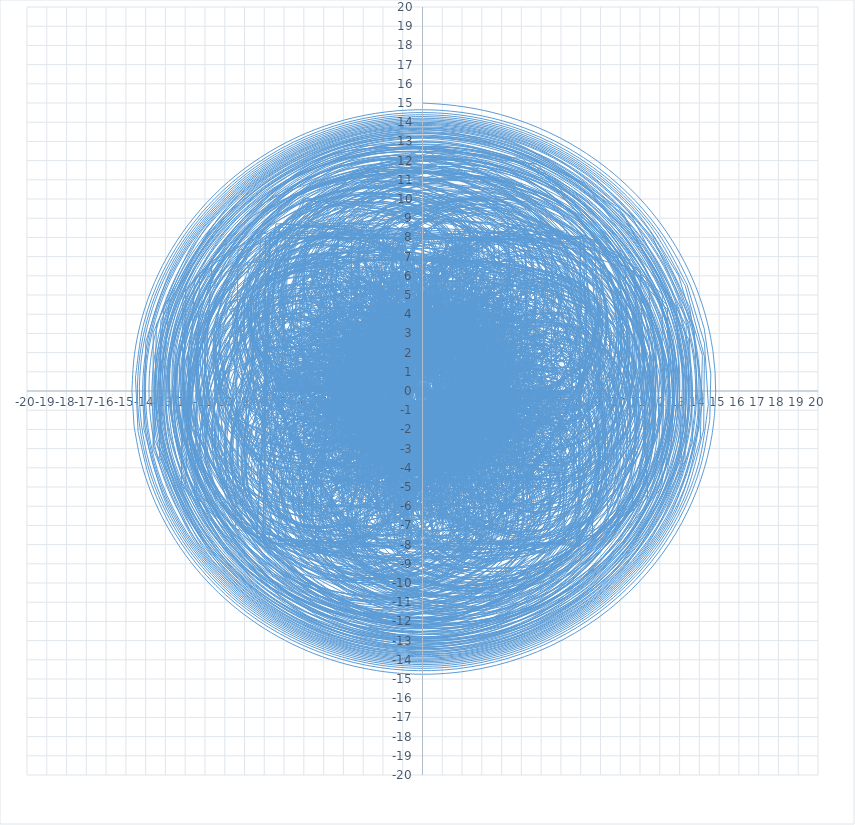
| Category | Series 0 |
|---|---|
| -5.104785228785916e-19 | -0.004 |
| -1.454440304915473e-05 | -0.008 |
| -6.544954789272613e-05 | -0.012 |
| -0.00017452973527082584 | -0.017 |
| -0.0003635918007768142 | -0.021 |
| -0.0006544237076970437 | -0.025 |
| -0.0010687748372749004 | -0.029 |
| -0.0016283256598540903 | -0.033 |
| -0.0023546444823498484 | -0.037 |
| -0.003269128988660912 | -0.042 |
| -0.004392930323844822 | -0.046 |
| -0.00574685752464488 | -0.05 |
| -0.007351260173526437 | -0.054 |
| -0.009225887256514537 | -0.058 |
| -0.011389720343262553 | -0.061 |
| -0.013860779387853956 | -0.065 |
| -0.016655899678104033 | -0.069 |
| -0.01979047874740811 | -0.072 |
| -0.02327819241423012 | -0.076 |
| -0.027130679538102973 | -0.079 |
| -0.0313571955852216 | -0.082 |
| -0.03596423568866606 | -0.084 |
| -0.04095512857461372 | -0.087 |
| -0.04632960351199377 | -0.089 |
| -0.052083333333344056 | -0.09 |
| -0.05820745757091802 | -0.091 |
| -0.06468809085488048 | -0.092 |
| -0.0715058229261951 | -0.092 |
| -0.07863521791963915 | -0.092 |
| -0.08604432196173382 | -0.091 |
| -0.0936941895891015 | -0.089 |
| -0.10153844100491545 | -0.086 |
| -0.10952286372834506 | -0.083 |
| -0.11758507372186076 | -0.079 |
| -0.1256542525644078 | -0.074 |
| -0.1336509786282715 | -0.068 |
| -0.14148717145962994 | -0.061 |
| -0.14906616959525373 | -0.053 |
| -0.15628296280176077 | -0.045 |
| -0.1630246001223116 | -0.035 |
| -0.169170795076693 | -0.024 |
| -0.17459474879623552 | -0.012 |
| -0.1791642106943304 | 0.001 |
| -0.18274279438364 | 0.015 |
| -0.1851915638615773 | 0.029 |
| -0.186370901409537 | 0.045 |
| -0.18614266411041525 | 0.061 |
| -0.18437263031766452 | 0.078 |
| -0.18093323075965861 | 0.095 |
| -0.1757065512109617 | 0.112 |
| -0.16858758481182182 | 0.129 |
| -0.15948770220919925 | 0.147 |
| -0.14833829680873786 | 0.164 |
| -0.13509455069822013 | 0.18 |
| -0.11973925441396206 | 0.195 |
| -0.10228660091732344 | 0.21 |
| -0.08278586123878236 | 0.223 |
| -0.06132483660784943 | 0.234 |
| -0.0380329699651304 | 0.243 |
| -0.013083989060555029 | 0.25 |
| 0.013302055545260299 | 0.254 |
| 0.04085750070759938 | 0.255 |
| 0.06926667561609934 | 0.253 |
| 0.09816654738278136 | 0.248 |
| 0.127148548254709 | 0.239 |
| 0.15576171515452092 | 0.227 |
| 0.18351725611770328 | 0.21 |
| 0.2098946356147542 | 0.19 |
| 0.23434924127211124 | 0.167 |
| 0.256321657859867 | 0.139 |
| 0.27524853052812187 | 0.108 |
| 0.2905749483386639 | 0.075 |
| 0.3017682216498594 | 0.038 |
| 0.3083328637149296 | -0.001 |
| 0.30982651917927023 | -0.041 |
| 0.30587651165811386 | -0.082 |
| 0.29619661132361036 | -0.123 |
| 0.280603553947006 | -0.164 |
| 0.25903277806202746 | -0.203 |
| 0.23155279015270086 | -0.24 |
| 0.1983775226483588 | -0.273 |
| 0.1598760198719595 | -0.302 |
| 0.11657877687089918 | -0.326 |
| 0.0691800691322319 | -0.343 |
| 0.01853565116887246 | -0.354 |
| -0.03434472798691112 | -0.357 |
| -0.08831044177295654 | -0.352 |
| -0.14208904836630892 | -0.338 |
| -0.19431144013107282 | -0.316 |
| -0.24354301812427367 | -0.285 |
| -0.28832059529040815 | -0.246 |
| -0.32719447228920173 | -0.2 |
| -0.35877485161411676 | -0.146 |
| -0.38178146772504423 | -0.087 |
| -0.39509502437536437 | -0.024 |
| -0.3978087581472327 | 0.042 |
| -0.38927820408051445 | 0.109 |
| -0.36916704111116105 | 0.175 |
| -0.33748675843736253 | 0.237 |
| -0.29462782549382976 | 0.295 |
| -0.2413800836303687 | 0.345 |
| -0.17894022068036178 | 0.385 |
| -0.10890445121675787 | 0.415 |
| -0.03324491218735728 | 0.432 |
| 0.04573120268054635 | 0.435 |
| 0.1254401105785025 | 0.423 |
| 0.20309710447583681 | 0.397 |
| 0.2758081741446588 | 0.356 |
| 0.34067544412454365 | 0.3 |
| 0.39491336520293174 | 0.233 |
| 0.4359716896305023 | 0.154 |
| 0.4616604220495559 | 0.068 |
| 0.4702712229981992 | -0.023 |
| 0.46068920725995766 | -0.116 |
| 0.43248878208377906 | -0.206 |
| 0.38600716318874356 | -0.291 |
| 0.32238953434429224 | -0.366 |
| 0.24360051197810248 | -0.427 |
| 0.15239765632443522 | -0.472 |
| 0.05226423163237646 | -0.497 |
| -0.05269976689887299 | -0.501 |
| -0.15792718506369668 | -0.483 |
| -0.2585704072065173 | -0.442 |
| -0.349719251003872 | -0.38 |
| -0.4266416897347561 | -0.299 |
| -0.48503675456905415 | -0.201 |
| -0.5212870184238623 | -0.091 |
| -0.5326966065820143 | 0.026 |
| -0.5176998796532736 | 0.145 |
| -0.47602593602436105 | 0.258 |
| -0.40880499759610334 | 0.362 |
| -0.31860464478693706 | 0.448 |
| -0.20938676936012024 | 0.513 |
| -0.0863799656819272 | 0.552 |
| 0.04413324134892146 | 0.561 |
| 0.17510963014777134 | 0.539 |
| 0.29910862132640015 | 0.486 |
| 0.40870969747851427 | 0.404 |
| 0.4969625912327408 | 0.297 |
| 0.557844440979084 | 0.171 |
| 0.5866948516684363 | 0.031 |
| 0.5805981595282876 | -0.114 |
| 0.5386825191718526 | -0.255 |
| 0.4623079456638762 | -0.382 |
| 0.3551202565913106 | -0.489 |
| 0.2229549129216034 | -0.566 |
| 0.07358381378367124 | -0.608 |
| -0.08369126967049006 | -0.611 |
| -0.23858334615383878 | -0.573 |
| -0.38047589313263386 | -0.496 |
| -0.499151476601666 | -0.383 |
| -0.5855458212889059 | -0.241 |
| -0.6324731220883463 | -0.08 |
| -0.6352651803677118 | 0.09 |
| -0.5922679647058213 | 0.258 |
| -0.5051448749450569 | 0.409 |
| -0.3789464335715813 | 0.533 |
| -0.22192104512542876 | 0.62 |
| -0.04506013006239162 | 0.661 |
| 0.13860779388175706 | 0.652 |
| 0.3149371733718577 | 0.592 |
| 0.469741137702348 | 0.485 |
| 0.5899455702243922 | 0.336 |
| 0.6647301834439254 | 0.158 |
| 0.6865578051435735 | -0.036 |
| 0.6519936980041591 | -0.231 |
| 0.562226294210133 | -0.41 |
| 0.4232193804005382 | -0.558 |
| 0.2454528166519929 | -0.66 |
| 0.04324271549978293 | -0.707 |
| -0.16632982175142835 | -0.693 |
| -0.3648130146247738 | -0.617 |
| -0.5339966464929975 | -0.484 |
| -0.657606910363201 | -0.305 |
| -0.7229285447523228 | -0.095 |
| -0.7221923522081626 | 0.127 |
| -0.653575139680829 | 0.342 |
| -0.5216844045811431 | 0.527 |
| -0.3374408873575283 | 0.665 |
| -0.11732584877526837 | 0.741 |
| 0.11797765905611353 | 0.745 |
| 0.3454548879898285 | 0.675 |
| 0.5419845988317993 | 0.536 |
| 0.6867123495191727 | 0.341 |
| 0.7633316363223538 | 0.107 |
| 0.7620225533610893 | -0.141 |
| 0.6808141904458223 | -0.379 |
| 0.5261811282988511 | -0.58 |
| 0.3127539638698174 | -0.723 |
| 0.062113450778844885 | -0.789 |
| -0.19926075323229867 | -0.77 |
| -0.44271323939954743 | -0.666 |
| -0.6405428090814026 | -0.486 |
| -0.7692054764711179 | -0.248 |
| -0.8122215765424814 | 0.021 |
| -0.7624240149704944 | 0.293 |
| -0.6232351980999136 | 0.534 |
| -0.40875340145115685 | 0.717 |
| -0.14255787897518044 | 0.817 |
| 0.1447068147290208 | 0.821 |
| 0.41875000000594875 | 0.725 |
| 0.6456973361156821 | 0.54 |
| 0.7963271691558705 | 0.285 |
| 0.8499533939606124 | -0.009 |
| 0.7974332809638068 | -0.306 |
| 0.6428536603390833 | -0.569 |
| 0.4035894647932895 | -0.762 |
| 0.10862213574813917 | -0.86 |
| -0.20476959016766846 | -0.846 |
| -0.49560545731555977 | -0.721 |
| -0.7245442741680301 | -0.498 |
| -0.8592853590868085 | -0.205 |
| -0.8792887084173167 | 0.12 |
| -0.7791135655360496 | 0.434 |
| -0.5698200723257227 | 0.691 |
| -0.27811529492949805 | 0.856 |
| 0.05677309474956199 | 0.902 |
| 0.38818339258459283 | 0.821 |
| 0.6684453951495252 | 0.621 |
| 0.855782057625634 | 0.329 |
| 0.9206930859563558 | -0.016 |
| 0.8508348850190159 | -0.363 |
| 0.6535709113547911 | -0.66 |
| 0.3556656845850766 | -0.863 |
| -9.618975334670968e-12 | -0.938 |
| -0.36036023215277385 | -0.87 |
| -0.6699714298546475 | -0.668 |
| -0.8795770555732143 | -0.359 |
| -0.9541143491028204 | 0.01 |
| -0.8788492379483361 | 0.382 |
| -0.662541279097799 | 0.698 |
| -0.336952979067996 | 0.906 |
| 0.047424984853695534 | 0.97 |
| 0.4289406906190735 | 0.876 |
| 0.7445641746569885 | 0.636 |
| 0.9403663433668403 | 0.287 |
| 0.9809556060291267 | -0.114 |
| 0.8562005876793911 | -0.5 |
| 0.5839291385733678 | -0.807 |
| 0.20791169080645602 | -0.978 |
| -0.20877798954092944 | -0.982 |
| -0.5941063270074136 | -0.815 |
| -0.8794894083746565 | -0.502 |
| -1.012154664014272 | -0.096 |
| -0.9652168792537067 | 0.332 |
| -0.7435087302789259 | 0.706 |
| -0.38386659288929464 | 0.955 |
| 0.05047809546807925 | 1.032 |
| 0.48066963644823024 | 0.919 |
| 0.8264097294780538 | 0.634 |
| 1.0210429074491112 | 0.226 |
| 1.0247126000327862 | -0.229 |
| 0.8329550755377463 | -0.646 |
| 0.4788267340094455 | -0.944 |
| 0.027813007563421692 | -1.062 |
| -0.4338524192935121 | -0.974 |
| -0.8154806043297573 | -0.694 |
| -1.0398128342377018 | -0.273 |
| -1.0589783332221911 | 0.208 |
| -0.8651884692089665 | 0.652 |
| -0.49371466845345263 | 0.969 |
| -0.017147154717167497 | 1.092 |
| 0.46831299197537035 | 0.991 |
| 0.8620628030678982 | 0.683 |
| 1.0800379758134402 | 0.23 |
| 1.0730303014151492 | -0.278 |
| 0.8383392739250188 | -0.731 |
| 0.42192221193239454 | -1.034 |
| -0.08988962770146636 | -1.117 |
| -0.5878108853193478 | -0.959 |
| -0.9627728522585834 | -0.59 |
| -1.1299931191917987 | -0.087 |
| -1.0486193349254107 | 0.441 |
| -0.7323216626949678 | 0.876 |
| -0.24800372428710715 | 1.119 |
| 0.2976419018847994 | 1.111 |
| 0.7812276816882795 | 0.85 |
| 1.0905367144133067 | 0.39 |
| 1.1509025020929342 | -0.164 |
| 0.9438531600934806 | -0.686 |
| 0.5132595510154553 | -1.052 |
| -0.04305635774874858 | -1.174 |
| -0.5949221564315137 | -1.018 |
| -1.0100351101189406 | -0.617 |
| -1.1858725725220707 | -0.062 |
| -1.0755807971752294 | 0.513 |
| -0.7012036099140817 | 0.969 |
| -0.15039988025729706 | 1.191 |
| 0.4432833155432017 | 1.12 |
| 0.9323797049396436 | 0.769 |
| 1.1921965754249906 | 0.221 |
| 1.153118232171668 | -0.388 |
| 0.8200588861162241 | -0.904 |
| 0.27348139209285727 | -1.194 |
| -0.3491021945523112 | -1.179 |
| -0.8871857537660258 | -0.857 |
| -1.1986216619021106 | -0.308 |
| -1.1976587945793067 | 0.328 |
| -0.8793983317881435 | 0.882 |
| -0.32352380635634437 | 1.207 |
| 0.32460221908786446 | 1.211 |
| 0.8913276291527126 | 0.888 |
| 1.2211755378854445 | 0.32 |
| 1.220005917937396 | -0.341 |
| 0.8827950124414352 | -0.914 |
| 0.29764283889301435 | -1.24 |
| -0.37612658271590227 | -1.223 |
| -0.9506992319175689 | -0.862 |
| -1.262099137330256 | -0.254 |
| -1.217578592652455 | 0.431 |
| -0.8242513604240725 | 1 |
| -0.18990793710627402 | 1.286 |
| 0.5053849106881662 | 1.202 |
| 1.0598044795983905 | 0.767 |
| 1.3084540005267633 | 0.103 |
| 1.1731585901695516 | -0.598 |
| 0.6881668887001827 | -1.127 |
| -0.006937652103412242 | -1.325 |
| -0.7063172786320451 | -1.126 |
| -1.1983920617442003 | -0.584 |
| -1.3301730350521799 | 0.14 |
| -1.055804487781072 | 0.828 |
| -0.45367403526814887 | 1.267 |
| 0.29449337591293984 | 1.317 |
| 0.9575404328769747 | 0.958 |
| 1.326135409677447 | 0.294 |
| 1.2795159184689677 | -0.468 |
| 0.8262854569551158 | -1.089 |
| 0.10516900102780252 | -1.367 |
| -0.6560932953830106 | -1.208 |
| -1.2120352678940833 | -0.658 |
| -1.3788774485287139 | 0.111 |
| -1.0963400796525251 | 0.85 |
| -0.4507850736296426 | 1.317 |
| 0.34948875568954096 | 1.351 |
| 1.0404027556894055 | 0.937 |
| 1.3891032342068037 | 0.205 |
| 1.2732495907585009 | -0.602 |
| 0.7253770185044223 | -1.212 |
| -0.07414260470977807 | -1.415 |
| -0.855078845421656 | -1.135 |
| -1.3481716363399823 | -0.462 |
| -1.3785133105371332 | 0.377 |
| -0.9289718581650638 | 1.092 |
| -0.15025966591383885 | 1.43 |
| 0.6879038794041373 | 1.267 |
| 1.289390594902873 | 0.654 |
| 1.4365843686788826 | -0.197 |
| 1.070407847496298 | -0.984 |
| 0.3156411036251879 | -1.424 |
| -0.5596745198666007 | -1.351 |
| -1.2383476240889937 | -0.786 |
| -1.4690773603379355 | 0.072 |
| -1.1607291573705476 | 0.91 |
| -0.42010603067238217 | 1.418 |
| 0.4829260958133139 | 1.403 |
| 1.2125025961680078 | 0.862 |
| 1.4916462192688744 | -0.008 |
| 1.2086182013082551 | -0.881 |
| 0.46352549152578515 | -1.427 |
| -0.4648130624087196 | -1.431 |
| -1.221812807695217 | -0.884 |
| -1.5124792670240208 | 0.008 |
| -1.2176065040163884 | 0.904 |
| -0.4446486342277143 | 1.454 |
| 0.5090554603697169 | 1.438 |
| 1.2692271193143767 | 0.853 |
| 1.531502743921516 | -0.075 |
| 1.1846641107412086 | -0.98 |
| 0.3598949359039483 | -1.499 |
| -0.616399602418759 | -1.418 |
| -1.3503814072571008 | -0.761 |
| -1.5397872687268543 | 0.211 |
| -1.0999831976103829 | 1.104 |
| -0.2039471753007621 | 1.549 |
| 0.7833333333713769 | 1.357 |
| 1.4523077278160663 | 0.599 |
| 1.5191779340593932 | -0.416 |
| 0.9481636057915845 | -1.263 |
| -0.027632976904017757 | -1.583 |
| -0.999046120827162 | -1.234 |
| -1.551494900764616 | -0.355 |
| -1.4427650688138232 | 0.682 |
| -0.7114162866537673 | 1.433 |
| 0.33352500406623026 | 1.569 |
| 1.241029538312055 | 1.023 |
| 1.612301069877421 | 0.025 |
| 1.277417269978045 | -0.991 |
| 0.37562472686677534 | -1.577 |
| -0.6995805323577577 | -1.467 |
| -1.4704618591079983 | -0.701 |
| -1.5875363009332835 | 0.384 |
| -0.990031050547445 | 1.304 |
| 0.06015675517679974 | 1.641 |
| 1.0905621627264805 | 1.233 |
| 1.629685761989935 | 0.258 |
| 1.4238107696425777 | -0.842 |
| 0.5590163035029724 | -1.561 |
| -0.5713342422977348 | -1.561 |
| -1.4433756730002911 | -0.833 |
| -1.6454496206485905 | 0.29 |
| -1.0744281328374172 | 1.285 |
| 0.00879205598690951 | 1.679 |
| 1.0954699324387178 | 1.278 |
| 1.6667240747628402 | 0.264 |
| 1.4423829446701206 | -0.884 |
| 0.5212255976328655 | -1.614 |
| -0.6587764970205111 | -1.567 |
| -1.5264421247662394 | -0.758 |
| -1.6539188856317317 | 0.428 |
| -0.9699706806863168 | 1.411 |
| 0.19730877507027061 | 1.705 |
| 1.2748012428155007 | 1.156 |
| 1.724787191031776 | 0.027 |
| 1.3148686488115104 | -1.123 |
| 0.24123337493908442 | -1.716 |
| -0.961517816859891 | -1.447 |
| -1.6846580027664246 | -0.442 |
| -1.5541631880226603 | 0.795 |
| -0.6271439116473064 | 1.634 |
| 0.6286371115508883 | 1.638 |
| 1.5680773229171092 | 0.796 |
| 1.7000324500154878 | -0.465 |
| 0.946627337743388 | -1.492 |
| -0.3075019813467456 | -1.744 |
| -1.40820217905557 | -1.081 |
| -1.7721230622043167 | 0.158 |
| -1.1979017175782845 | 1.321 |
| 0.018718314172996308 | 1.787 |
| 1.2333019481654293 | 1.3 |
| 1.7924837421699529 | 0.11 |
| 1.3869238369545451 | -1.147 |
| 0.22612204215540993 | -1.79 |
| -1.0654634129346343 | -1.461 |
| -1.7821495199719373 | -0.33 |
| -1.5235848650633281 | 0.989 |
| -0.4219743075451373 | 1.771 |
| 0.9207629135222993 | 1.576 |
| 1.7591851454026954 | 0.501 |
| 1.6187372535418796 | -0.861 |
| 0.5678187270965085 | -1.748 |
| -0.8102213045479602 | -1.654 |
| -1.7377977139898182 | -0.622 |
| -1.6820868017070945 | 0.77 |
| -0.6644739063811003 | 1.731 |
| 0.7410086864861432 | 1.704 |
| 1.7280950229141434 | 0.695 |
| 1.7208112162700213 | -0.723 |
| 0.7129191623536449 | -1.73 |
| -0.7175314357541211 | -1.732 |
| -1.7361236215395877 | -0.719 |
| -1.73871257553347 | 0.724 |
| -0.7131744850496673 | 1.748 |
| 0.7421710456461705 | 1.74 |
| 1.7639166393275851 | 0.695 |
| 1.7357363694894044 | -0.773 |
| 0.6637392733680322 | -1.785 |
| -0.8155412560358355 | -1.725 |
| -1.8093882487834796 | -0.619 |
| -1.7077625046580729 | 0.87 |
| -0.5615973160779434 | 1.837 |
| 0.9361956073862369 | 1.682 |
| 1.8660207064174565 | 0.49 |
| 1.6466720726332382 | -1.013 |
| 0.40282890087793566 | -1.895 |
| -1.099772110097674 | -1.6 |
| -1.9224052388225188 | -0.301 |
| -1.5408022740806115 | 1.195 |
| -0.18390332885901672 | 1.945 |
| 1.2976309278198974 | 1.467 |
| 1.9618275002668029 | 0.051 |
| 1.37600456961458 | -1.405 |
| -0.09627475472588515 | -1.968 |
| -1.515151174891184 | -1.267 |
| -1.9622346214574489 | 0.258 |
| -1.1375932653565821 | 1.625 |
| 0.4335596923625365 | 1.94 |
| 1.7300244329673955 | 0.987 |
| 1.8970709810123132 | -0.62 |
| 0.8134732860682344 | -1.827 |
| -0.8151680222477978 | -1.831 |
| -1.9111187611529543 | -0.617 |
| -1.7375835455492323 | 1.015 |
| -0.39860896967360887 | 1.977 |
| 1.2161678593620773 | 1.614 |
| 2.018757600817045 | 0.159 |
| 1.4571979458118907 | -1.412 |
| -0.0993278653465198 | -2.031 |
| -1.5967754193614292 | -1.266 |
| -2.0074787695920575 | 0.372 |
| -1.0383389008062465 | 1.763 |
| 0.6538665841545267 | 1.943 |
| 1.901892493001225 | 0.776 |
| 1.8323546894459757 | -0.938 |
| 0.48148106285638026 | -2.006 |
| -1.2147561881529068 | -1.672 |
| -2.0647300744110324 | -0.159 |
| -1.459544008259309 | 1.475 |
| 0.18482605900387714 | 2.071 |
| 1.7065667589944482 | 1.195 |
| 2.0163701623516905 | -0.54 |
| 0.8806665761993582 | -1.897 |
| -0.8956708554438156 | -1.895 |
| -2.0340246383962657 | -0.522 |
| -1.7023065922685758 | 1.237 |
| -0.12871067074561088 | 2.104 |
| 1.547496873761366 | 1.438 |
| 2.0970829289832964 | -0.287 |
| 1.1049745941029483 | -1.81 |
| -0.709339575975347 | -2.003 |
| -2.007040841487151 | -0.711 |
| -1.8170174594473483 | 1.118 |
| -0.2678997866326264 | 2.121 |
| 1.4904132394488867 | 1.538 |
| 2.135954342318837 | -0.206 |
| 1.1709739251879567 | -1.803 |
| -0.6870915122211587 | -2.042 |
| -2.032007259257815 | -0.728 |
| -1.8319011549275348 | 1.149 |
| -0.2264783369645877 | 2.155 |
| 1.5615668166496015 | 1.508 |
| 2.1533014555170578 | -0.306 |
| 1.0796870148571769 | -1.893 |
| -0.8390447879168962 | -2.016 |
| -2.1129627450383133 | -0.566 |
| -1.7387660707320276 | 1.334 |
| 0.0038324503246826573 | 2.196 |
| 1.7523658197269543 | 1.33 |
| 2.122970824283734 | -0.593 |
| 0.8093568755692003 | -2.055 |
| -1.1560280745394567 | -1.886 |
| -2.206829021548544 | -0.209 |
| -1.4917794753626155 | 1.645 |
| 0.428361375643575 | 2.183 |
| 2.012013029750977 | 0.96 |
| 1.971916290658544 | -1.048 |
| 0.32686077628240306 | -2.213 |
| -1.5933754873558794 | -1.577 |
| -2.2175668409742904 | 0.355 |
| -1.0214786242987044 | 2.005 |
| 1.0233702516116947 | 2.008 |
| 2.231142696882828 | 0.349 |
| 1.5914305150150503 | -1.608 |
| -0.3780091593531828 | -2.235 |
| -2.0410114801965364 | -0.995 |
| -1.9993089312421608 | 1.086 |
| -0.2738118783770136 | 2.263 |
| 1.6915038282785584 | 1.534 |
| 2.232409592904979 | -0.499 |
| 0.8769828657103276 | -2.117 |
| -1.233550350945712 | -1.936 |
| -2.297982509233202 | -0.096 |
| -1.3930971270510544 | 1.835 |
| 0.7171447585307813 | 2.194 |
| 2.2172706369224917 | 0.657 |
| 1.8003881439523484 | -1.458 |
| -0.18612833702137108 | -2.313 |
| -2.019568271139538 | -1.152 |
| -2.0916558951453466 | 1.025 |
| -0.32473723542961663 | 2.311 |
| 1.7371010296503446 | 1.564 |
| 2.2711169690896145 | -0.57 |
| 0.7907692935791046 | -2.209 |
| -1.4011284562875503 | -1.887 |
| -2.3509403630603187 | 0.123 |
| -1.1969446391862368 | 2.032 |
| 1.0393562889197094 | 2.122 |
| 2.348004793129864 | 0.297 |
| 1.536584265321598 | -1.805 |
| -0.6745364438184037 | -2.277 |
| -2.2811919525840985 | -0.676 |
| -1.809596615714718 | 1.551 |
| 0.3240209293412526 | 2.365 |
| 2.1693469342460725 | 1.007 |
| 2.020625338842734 | -1.287 |
| -1.570031099920608e-10 | -2.4 |
| -2.029905054313018 | -1.288 |
| -2.177332140364981 | 1.029 |
| -0.28983012352996335 | 2.395 |
| 1.878102740289433 | 1.521 |
| 2.2889428850440616 | -0.788 |
| 0.5413815311687026 | -2.364 |
| -1.7266503887308091 | -1.709 |
| -2.3651051013691253 | 0.572 |
| -0.7532289236324029 | 2.318 |
| 1.5857356514658267 | 1.857 |
| 2.4150496023185792 | -0.387 |
| 0.925709927549955 | -2.268 |
| -1.463235214112912 | -1.97 |
| -2.4470156543031933 | 0.236 |
| -1.0601335757367736 | 2.223 |
| 1.3650324882762839 | 2.055 |
| 2.4678834976727613 | -0.121 |
| 1.1581262901418115 | -2.187 |
| -1.2953610251734236 | -2.114 |
| -2.482955109635348 | 0.043 |
| -1.2211230869656438 | 2.167 |
| 1.2571146628246328 | 2.151 |
| 2.495829531962454 | -0.004 |
| 1.2499999998464013 | -2.165 |
| -1.252083333489298 | -2.169 |
| -2.5083295129238667 | 0.004 |
| -1.244839904279433 | 2.182 |
| 1.2810875631275394 | 2.166 |
| 2.520449398203566 | -0.044 |
| 1.2048258694942742 | -2.219 |
| -1.3439955741875664 | -2.143 |
| -2.530308881255893 | 0.124 |
| -1.128261767014511 | 2.273 |
| 1.4396158523376645 | 2.095 |
| 2.5341128216584647 | -0.244 |
| 1.012727120944947 | -2.34 |
| -1.565466766355485 | -2.018 |
| -2.5261336555742124 | 0.405 |
| -0.8553800766051519 | 2.416 |
| 1.7174352231311247 | 1.907 |
| 2.4987497389418056 | -0.605 |
| 0.6534267071185067 | -2.491 |
| -1.8893502265894457 | -1.756 |
| -2.4425896535674703 | 0.841 |
| -0.40477417809734634 | 2.556 |
| 2.0725160733652612 | 1.556 |
| 2.3468476184092126 | -1.109 |
| 0.10887669949593755 | -2.598 |
| -2.2552744891225784 | -1.302 |
| -2.199846021053152 | 1.401 |
| 0.2322363507657566 | 2.602 |
| 2.422694696996498 | 0.989 |
| 1.9899235511727378 | -1.706 |
| -0.6127940803223811 | -2.552 |
| -2.5565225824272093 | -0.614 |
| -1.706715739308021 | 2.005 |
| 1.022072359461207 | 2.431 |
| 2.635549303271731 | 0.18 |
| 1.3428619184848862 | -2.28 |
| -1.4432934429688147 | -2.222 |
| -2.636576882006531 | 0.305 |
| -0.8961115617732575 | 2.503 |
| 1.8528678210812566 | 1.912 |
| 2.5361507100533607 | -0.824 |
| 0.3717081569323749 | -2.645 |
| -2.2202828627515965 | -1.492 |
| -2.313180579223062 | 1.352 |
| 0.21520044716946743 | 2.675 |
| 2.508997396290586 | 0.963 |
| 1.9524660151552617 | -1.853 |
| -0.8375318750926413 | -2.562 |
| -2.678709693577223 | -0.338 |
| -1.4489649578993304 | 2.283 |
| 1.4551864394648677 | 2.284 |
| 2.689294186446757 | -0.354 |
| 0.8123941520782249 | -2.592 |
| -2.015605839217814 | -1.828 |
| -2.506513580110837 | 1.069 |
| -0.07144125452530888 | 2.728 |
| 2.456703726652756 | 1.198 |
| 2.109280001950506 | -1.745 |
| -0.72345194554816 | -2.644 |
| -2.712773131461653 | -0.425 |
| -1.4977573460930773 | 2.306 |
| 1.5000266758038052 | 2.31 |
| 2.7236164169167565 | -0.436 |
| 0.7010063216838284 | -2.672 |
| -2.1682185654180426 | -1.719 |
| -2.4465006217657197 | 1.301 |
| 0.21772399088726532 | 2.766 |
| 2.6293288931541854 | 0.9 |
| 1.869622306766336 | -2.062 |
| -1.1603827086509177 | -2.534 |
| -2.790710032216977 | 0.073 |
| -1.0246763461527686 | 2.601 |
| 2.0005235031475235 | 1.959 |
| 2.585057920815584 | -1.087 |
| -0.004901464079743656 | -2.808 |
| -2.5984111852851797 | -1.076 |
| -1.991684100162039 | 1.992 |
| 1.0840330562390443 | 2.604 |
| 2.8249612755976665 | -0.015 |
| 1.0552446012969756 | -2.625 |
| -2.038129434472593 | -1.968 |
| -2.592185235955164 | 1.154 |
| 0.10412920583714244 | 2.84 |
| 2.6792682588664425 | 0.959 |
| 1.8847388159749894 | -2.138 |
| -1.2957645515756917 | -2.543 |
| -2.845174133640693 | 0.274 |
| -0.7842082632502949 | 2.753 |
| 2.283385765164825 | 1.733 |
| 2.445166073293746 | -1.504 |
| -0.5239271360567849 | -2.827 |
| -2.8309547547441953 | -0.525 |
| -1.5022444382413644 | 2.461 |
| 1.7697691176403236 | 2.282 |
| 2.7638348010441387 | -0.85 |
| 0.1767863954602295 | -2.89 |
| -2.6492818272771665 | -1.18 |
| -2.0319389512077755 | 2.075 |
| 1.242899119604587 | 2.629 |
| 2.9009696029838734 | -0.259 |
| 0.7548888812757589 | -2.817 |
| -2.3926065961907557 | -1.675 |
| -2.3930879233040288 | 1.682 |
| 0.7729281424681036 | 2.825 |
| 2.924688073221112 | 0.225 |
| 1.1947888887712763 | -2.684 |
| -2.133809608260663 | -2.025 |
| -2.622418553450407 | 1.342 |
| 0.4003609389712829 | 2.923 |
| 2.8958844284197074 | 0.584 |
| 1.5014676568371594 | -2.549 |
| -1.9239898434042573 | -2.253 |
| -2.758336908025569 | 1.092 |
| 0.14512452473265183 | 2.967 |
| 2.86118039599141 | 0.815 |
| 1.6874185805903221 | -2.455 |
| -1.7954148193113115 | -2.383 |
| -2.8314581248062516 | 0.953 |
| 0.01566425876766238 | 2.992 |
| 2.850818235049867 | 0.921 |
| 1.7633557566285485 | -2.427 |
| -1.7658048623461466 | -2.43 |
| -2.8594681592172826 | 0.935 |
| 0.015773341353979422 | 3.012 |
| 2.878624991118022 | 0.902 |
| 1.7326788178868022 | -2.475 |
| -1.8415033230036877 | -2.4 |
| -2.8446730051941254 | 1.041 |
| 0.14817763536571232 | 3.03 |
| 2.9420713520079915 | 0.755 |
| 1.5892664674028998 | -2.593 |
| -2.0182302304333373 | -2.281 |
| -2.7731701324575977 | 1.27 |
| 0.4144979778000875 | 3.026 |
| 3.021510589528675 | 0.473 |
| 1.3184402336770695 | -2.764 |
| -2.278977465019293 | -2.052 |
| -2.6155114600911973 | 1.609 |
| 0.8114096289666859 | 2.966 |
| 3.0787867975217336 | 0.048 |
| 0.9014794225754116 | -2.949 |
| -2.589395378715244 | -1.682 |
| -2.3297668209771225 | 2.032 |
| 1.3230287190425685 | 2.799 |
| 3.05658771486186 | -0.517 |
| 0.32447377105045955 | -3.087 |
| -2.892047940603591 | -1.139 |
| -1.868807951049694 | 2.489 |
| 1.9102269841590096 | 2.463 |
| 2.881185219105667 | -1.199 |
| -0.4078943510353684 | -3.098 |
| -3.1023962120944772 | -0.408 |
| -1.1940205122373835 | 2.897 |
| 2.4991126180158605 | 1.897 |
| 2.472287527109528 | -1.939 |
| -1.2543981129861186 | -2.885 |
| -3.111218272818714 | 0.493 |
| -0.2968333045684061 | 3.14 |
| 2.9734778041526466 | 1.065 |
| 1.763868906846135 | -2.625 |
| -2.118913587072829 | -2.353 |
| -2.799679658852089 | 1.489 |
| 0.7734776627745746 | 3.079 |
| 3.1791230874347205 | -0.017 |
| 0.7377308257646534 | -3.097 |
| -2.8400832960181366 | -1.447 |
| -2.072821687303148 | 2.427 |
| 1.8829733590115936 | 2.582 |
| 2.9499620849381487 | -1.24 |
| -0.5343548596411171 | -3.159 |
| -3.2023491449600425 | -0.196 |
| -0.9123992944969127 | 3.08 |
| 2.8024044259569325 | 1.579 |
| 2.163500064492675 | -2.386 |
| -1.8543919381533716 | -2.639 |
| -2.983360990253555 | 1.236 |
| 0.5614624415049789 | 3.184 |
| 3.2346601624614415 | 0.136 |
| 0.8225986699844953 | -3.136 |
| -2.894626148353992 | -1.469 |
| -2.0452912706071307 | 2.526 |
| 2.0479134395162717 | 2.529 |
| 2.9006100548444698 | -1.484 |
| -0.8608858258955867 | -3.147 |
| -3.2602206461739223 | 0.205 |
| -0.45521201732718886 | 3.239 |
| 3.087150883460665 | 1.093 |
| 1.6839873553629139 | -2.814 |
| -2.432308424747384 | -2.205 |
| -2.6392624494479384 | 1.96 |
| 1.4170990273607995 | 2.971 |
| 3.190853264643092 | -0.825 |
| -0.20720871485762782 | -3.293 |
| -3.278112325644917 | -0.414 |
| -1.0168381434950495 | 3.148 |
| 2.911081685891624 | 1.581 |
| 2.0872459633236495 | -2.578 |
| -2.1611127134893238 | -2.521 |
| -2.870790205554436 | 1.678 |
| 1.1441004002876545 | 3.126 |
| 3.282692509966888 | -0.579 |
| -4.256973979295264e-10 | -3.338 |
| -3.291906998307244 | -0.575 |
| -1.1278645517376857 | 3.15 |
| 2.918566267463585 | 1.645 |
| 2.110845477977429 | -2.607 |
| -2.225298995583202 | -2.515 |
| -2.8484474604166707 | 1.787 |
| 1.3046358081227667 | 3.104 |
| 3.2763185393471113 | -0.793 |
| -0.2647994485197361 | -3.365 |
| -3.368749823607837 | -0.265 |
| -0.7840804063907834 | 3.291 |
| 3.1363866062122474 | 1.28 |
| 1.7417607461818339 | -2.91 |
| -2.6203084813728315 | -2.16 |
| -2.5266924063225957 | 2.275 |
| 1.883837065924199 | 2.835 |
| 3.0814146899008468 | -1.457 |
| -1.0034126102916054 | -3.262 |
| -3.3746018302954575 | 0.534 |
| 0.059701774145853086 | 3.42 |
| 3.4001938961634424 | 0.411 |
| 0.8701782845252843 | -3.317 |
| -3.1742747155786324 | -1.308 |
| -1.7187499995981808 | 2.977 |
| 2.730457746454409 | 2.095 |
| 2.4323157869656256 | -2.441 |
| -2.1145293354743986 | -2.726 |
| -2.9731464180368286 | 1.758 |
| 1.3790071971340534 | 3.171 |
| 3.319913331846467 | -0.983 |
| -0.5781316557510983 | -3.418 |
| -3.466689634999137 | 0.17 |
| -0.23635313458097165 | 3.467 |
| 3.4209076993206184 | 0.634 |
| 1.0184281043214498 | -3.331 |
| -3.200669257266368 | -1.385 |
| -1.7299765168529273 | 3.033 |
| 2.8317705683449192 | 2.05 |
| 2.3419571218895796 | -2.601 |
| -2.3447451668145756 | -2.604 |
| -2.8346978423845983 | 2.067 |
| 1.772153279078988 | 3.033 |
| 3.1974803166075505 | -1.464 |
| -1.1462712109573003 | -3.329 |
| -3.427603969284939 | 0.823 |
| 0.4972639315464538 | 3.494 |
| 3.5291150185816647 | -0.173 |
| 0.14813512456192152 | -3.534 |
| -3.5113672174319106 | -0.462 |
| -0.7674587972566531 | 3.462 |
| 3.3875531663856466 | 1.062 |
| 1.3429091293435385 | -3.291 |
| -3.1733128764120013 | -1.61 |
| -1.8614011363594198 | 3.038 |
| 2.8854939469092233 | 2.096 |
| 2.3143281463157055 | -2.719 |
| -2.541108119464815 | -2.515 |
| -2.6971289746015925 | 2.353 |
| 2.1565038333806013 | 2.862 |
| 3.0087306622161876 | -1.954 |
| -1.7467545751509257 | -3.138 |
| -3.250930167927936 | 1.537 |
| 1.3252483901613665 | 3.347 |
| 3.4277661939813004 | -1.114 |
| -0.9034545151491022 | -3.493 |
| -3.544919748568054 | 0.695 |
| 0.490837987509566 | 3.583 |
| 3.6091701890333017 | -0.29 |
| -0.09489143816237884 | -3.624 |
| -3.6279230419047446 | -0.095 |
| -0.27874580164475693 | 3.623 |
| 3.6088172261004288 | 0.456 |
| 0.6261084729751174 | -3.587 |
| -3.559412526078812 | -0.789 |
| -0.944689514084595 | 3.526 |
| 3.4869532006197153 | 1.093 |
| 1.2332068198719401 | -3.444 |
| -3.398200280115221 | -1.366 |
| -1.4913676907631195 | 3.35 |
| 3.29932314520497 | 1.609 |
| 1.7196420669035417 | -3.248 |
| -3.1958401138201524 | -1.823 |
| -1.9190521434576213 | 3.144 |
| 3.09259771961137 | 2.008 |
| 2.0909830241727416 | -3.042 |
| -2.993778896486903 | -2.167 |
| -2.2370167245301458 | 2.947 |
| 2.902931181872519 | 2.301 |
| 2.3587900664114114 | -2.861 |
| -2.8230071476711918 | -2.411 |
| -2.45787576567833 | 2.788 |
| 2.756410435746725 | 2.499 |
| 2.535685236437883 | -2.729 |
| -2.7050419256408658 | -2.567 |
| -2.5933912492853253 | 2.686 |
| 2.6703416405468063 | 2.615 |
| 2.6318685125895023 | -2.66 |
| -2.653322975900901 | -2.644 |
| -2.6516504290231353 | 2.652 |
| 2.6545967081324955 | 2.655 |
| 2.652900652703401 | -2.662 |
| -2.6743830208745876 | -2.647 |
| -2.6353985821635804 | 2.691 |
| 2.7125104975354417 | 2.619 |
| 2.598538522799208 | -2.738 |
| -2.768401705421394 | -2.573 |
| -2.5413428958125692 | 2.803 |
| 2.8410456766371475 | 2.505 |
| 2.462490516112151 | -2.883 |
| -2.928958314840524 | -2.414 |
| -2.3603615645641813 | 2.978 |
| 3.0301325635315925 | 2.3 |
| 2.2331013913902495 | -3.085 |
| -3.1419810944804207 | -2.159 |
| -2.078705649773847 | 3.201 |
| 3.2612753382539017 | 1.991 |
| 1.8951294061960955 | -3.323 |
| -3.3840858921819392 | -1.792 |
| -1.6804227287799745 | 3.445 |
| 3.505730693967032 | 1.561 |
| 1.4328947307926252 | -3.564 |
| -3.620738803809355 | -1.296 |
| -1.1513070495647626 | 3.674 |
| 3.722839122325977 | 0.998 |
| 0.8350961764691089 | -3.767 |
| -3.8049847723859798 | -0.664 |
| -0.48462183579110696 | 3.836 |
| 3.8594250284626646 | 0.297 |
| 0.10143567402698324 | -3.874 |
| -3.8778373731169347 | 0.102 |
| 0.31143915681322787 | 3.871 |
| 3.8515322297415957 | -0.528 |
| -0.7492313203893227 | -3.819 |
| -3.771741848803714 | 0.975 |
| 1.2051662787067319 | 3.709 |
| 3.630002363405274 | -1.437 |
| -1.67025698335457 | -3.533 |
| -3.418633822291656 | 1.903 |
| 2.1331695543855966 | 3.285 |
| 3.131316728563131 | -2.36 |
| -2.580197840263338 | -2.958 |
| -2.763755019300212 | 2.793 |
| 2.995384010094812 | 2.549 |
| 2.3144044303378037 | -3.186 |
| -3.3608233148630613 | -2.06 |
| -1.7852319565328718 | 3.519 |
| 3.657188810264913 | 1.492 |
| 1.1824571320349468 | -3.773 |
| -3.8645050283369726 | -0.857 |
| -0.5172100359655285 | 3.929 |
| 3.9631872260887153 | 0.166 |
| -0.19397429494605778 | -3.966 |
| -3.935344039321899 | 0.56 |
| 0.9289180110428961 | 3.869 |
| 3.7663156592351017 | -1.297 |
| -1.659919659800021 | -3.626 |
| -3.4463872391375765 | 2.014 |
| 2.3543304451785048 | 3.229 |
| 2.9725793014191666 | -2.677 |
| -2.9756757391746085 | -2.679 |
| -2.3503758626537707 | 3.247 |
| 3.485383952051116 | 1.988 |
| 1.5952106933677583 | -3.686 |
| -3.8451420398189127 | -1.176 |
| -0.7334979893727583 | 3.958 |
| 4.019836240192883 | 0.274 |
| -0.19702740559157575 | -4.029 |
| -3.980958999546545 | 0.673 |
| 1.1478953522372262 | 3.875 |
| 3.7102722173146003 | -1.613 |
| -2.0616177344413367 | -3.486 |
| -3.203420112205516 | 2.485 |
| 2.874679175305174 | 2.865 |
| 2.4730933047393653 | -3.223 |
| -3.5218366424416567 | -2.033 |
| -1.5512739896776744 | 3.764 |
| 3.9416160927579353 | 1.034 |
| 0.4900581876409111 | -4.05 |
| -4.082711421874991 | 0.071 |
| 0.639425876626498 | 4.037 |
| 3.9107864186530277 | -1.203 |
| -1.7503865828333283 | -3.703 |
| -3.414977086475084 | 2.269 |
| 2.746223530853109 | 3.05 |
| 2.613221354362941 | -3.17 |
| -3.528791925195948 | -2.112 |
| -1.5554445716632472 | 3.812 |
| 4.0086472649734075 | 0.955 |
| 0.3236437690767915 | -4.112 |
| -4.116437823809786 | 0.324 |
| 0.9719207349441542 | 4.017 |
| 3.814208789383631 | -1.603 |
| -2.20087578419059 | -3.508 |
| -3.1050455918973943 | 2.747 |
| 3.2251557405606937 | 2.612 |
| 2.039296009095633 | -3.619 |
| -3.914948349121819 | -1.402 |
| -0.715654879099814 | 4.101 |
| 4.166666666666648 | 0 |
| -0.7242576085030568 | -4.107 |
| -3.9207185022085476 | 1.435 |
| 2.108505028582256 | 3.608 |
| 3.1762849684720282 | -2.722 |
| -3.2542987141302318 | -2.635 |
| -2.0000904693464823 | 3.684 |
| 3.9927315198701305 | 1.29 |
| 0.5263995801288535 | -4.167 |
| -4.195870704046972 | 0.264 |
| 1.0536825178891474 | 4.074 |
| 3.802140509955348 | -1.814 |
| -2.5140815567939474 | -3.385 |
| -2.8352206534628923 | 3.127 |
| 3.625324227126331 | 2.17 |
| 1.4117248413611474 | -3.987 |
| -4.1921348244602425 | -0.589 |
| 0.266074827373951 | 4.229 |
| 4.09133104972841 | -1.119 |
| -1.934167752743818 | -3.78 |
| -3.302870335637916 | 2.675 |
| 3.3061084449186384 | 2.677 |
| 1.9266178030312118 | -3.798 |
| -4.122978796432496 | -1.082 |
| -0.17866945502307086 | 4.263 |
| 4.205949778334995 | -0.742 |
| -1.6359716741852164 | -3.95 |
| -3.50099899863108 | 2.461 |
| 3.173113021364725 | 2.877 |
| 2.104749842839502 | -3.735 |
| -4.114934695733174 | -1.219 |
| -0.26225435018052706 | 4.288 |
| 4.239782959251793 | -0.717 |
| -1.667931670859202 | -3.968 |
| -3.4810897492545485 | 2.538 |
| 3.2792507272465654 | 2.801 |
| 1.9597256563912273 | -3.846 |
| -4.203202440644264 | -1.001 |
| 0.02264554449705696 | 4.325 |
| 4.1987375992776395 | -1.055 |
| -2.0343767728922466 | -3.826 |
| -3.2233906798826553 | 2.902 |
| 3.603636671645229 | 2.422 |
| 1.4649598096817744 | -4.091 |
| -4.33069454611224 | -0.409 |
| 0.6811417341290047 | 4.301 |
| 3.9968534904848063 | -1.738 |
| -2.691819006046575 | -3.433 |
| -2.640082800806854 | 3.478 |
| 4.041036622277752 | 1.666 |
| 0.5710520900128461 | -4.338 |
| -4.341702288640603 | 0.572 |
| 1.6844944985502779 | 4.047 |
| 3.4668051162061024 | -2.689 |
| -3.511948459103283 | -2.637 |
| -1.6110783082368605 | 4.09 |
| 4.375896339722316 | 0.46 |
| -0.7344773562892328 | -4.342 |
| -3.9854972393351766 | 1.884 |
| 2.900668272808848 | 3.325 |
| 2.405489070489759 | -3.704 |
| -4.227663942274986 | -1.293 |
| -0.06950487811291405 | 4.424 |
| 4.272185565657002 | -1.169 |
| -2.3230041839828193 | -3.776 |
| -2.9692670649744954 | 3.298 |
| 4.008982971752551 | 1.912 |
| 0.6878165914316258 | -4.392 |
| -4.408827889961055 | 0.604 |
| 1.854184029781417 | 4.05 |
| 3.3390942545114792 | -2.954 |
| -3.804906733959736 | -2.332 |
| -1.110814828347801 | 4.326 |
| 4.465495772313934 | -0.218 |
| -1.5378771342322421 | -4.202 |
| -3.553561836097472 | 2.727 |
| 3.6725316658218286 | 2.572 |
| 1.3419455542613128 | -4.282 |
| -4.49160509600589 | 0.024 |
| 1.396749449203416 | 4.273 |
| 3.640576474073993 | -2.645 |
| -3.643947379443527 | -2.647 |
| -1.3856660842507886 | 4.29 |
| 4.512438143760966 | -0.024 |
| -1.4406328813282077 | -4.281 |
| -3.61049803437019 | 2.721 |
| 3.729171004116195 | 2.563 |
| 1.2408069603033698 | -4.356 |
| -4.527921155895787 | 0.221 |
| 1.6703651588004598 | 4.219 |
| 3.453510426402917 | -2.95 |
| -3.9168225590524983 | -2.307 |
| -0.8993408976698932 | 4.46 |
| 4.512030790000045 | -0.618 |
| -2.0765255364391555 | -4.058 |
| -3.1406177508158253 | 3.31 |
| 4.171857590344013 | 1.857 |
| 0.3506698899729467 | -4.557 |
| -4.41285018915566 | 1.207 |
| 2.6330448842112406 | 3.746 |
| 2.6288919990396695 | -3.754 |
| -4.43118472838692 | -1.187 |
| 0.4081729808816708 | 4.573 |
| 4.155012717342782 | -1.964 |
| -3.2865743270914747 | -3.218 |
| -1.8726832931416137 | 4.206 |
| 4.599737862795624 | 0.281 |
| -1.356261001207963 | -4.409 |
| -3.6478823064442474 | 2.83 |
| 3.944115976331253 | 2.407 |
| 0.8428393042917558 | -4.548 |
| -4.551650842724297 | 0.844 |
| 2.4278013652964856 | 3.946 |
| 2.803828394267708 | -3.694 |
| -4.464082578805421 | -1.272 |
| 0.4452833930576694 | 4.624 |
| 4.14318033695432 | -2.111 |
| -3.491141937333642 | -3.078 |
| -1.5703020777324936 | 4.386 |
| 4.659368635950415 | -0.171 |
| -1.8981043354145826 | -4.263 |
| -3.2446334711794855 | 3.36 |
| 4.3376344874133625 | 1.744 |
| -0.02449994859917237 | -4.679 |
| -4.3237011830277545 | 1.8 |
| 3.3145630376449517 | 3.315 |
| 1.7954231024205094 | -4.335 |
| -4.695826181169867 | 0.008 |
| 1.821323257420336 | 4.333 |
| 3.2913329634813397 | -3.361 |
| -4.380716049685644 | -1.726 |
| 0.12335887009564381 | 4.711 |
| 4.288563647171198 | -1.963 |
| -3.4972150324448674 | -3.171 |
| -1.530509799844022 | 4.47 |
| 4.714588224017735 | -0.371 |
| -2.222165398258425 | -4.179 |
| -2.9426876081154396 | 3.713 |
| 4.586461261388159 | 1.203 |
| -0.7505918287227286 | -4.686 |
| -3.9836851970731186 | 2.587 |
| 3.9871796591104958 | 2.589 |
| 0.7361635869256035 | -4.701 |
| -4.593704705078954 | 1.257 |
| 3.0383876854228182 | 3.673 |
| 2.0913956783577468 | -4.288 |
| -4.773363726790903 | -0.125 |
| 1.875044470915121 | 4.396 |
| 3.21306348466783 | -3.544 |
| -4.568425573145996 | -1.432 |
| 0.6254380056385834 | 4.751 |
| 4.0447648081988445 | -2.577 |
| -4.052774043085344 | -2.572 |
| -0.6021217416569473 | 4.766 |
| 4.570396475848485 | -1.494 |
| -3.3127063964514205 | -3.491 |
| -1.7261389557854878 | 4.497 |
| 4.805304843121708 | -0.387 |
| -2.434345786018346 | -4.166 |
| -2.6934440877114736 | 4.008 |
| 4.7862956657639 | 0.673 |
| -1.494869711519783 | -4.601 |
| -3.4769281574333744 | 3.369 |
| 4.562209348839173 | 1.634 |
| -0.5574451811891131 | -4.818 |
| -4.071046714522364 | 2.644 |
| 4.186081671810026 | 2.466 |
| 0.33072434954583085 | -4.851 |
| -4.486400670552497 | 1.886 |
| 3.7093261738150165 | 3.157 |
| 1.1380461475109585 | -4.74 |
| -4.744354902963627 | 1.139 |
| 3.1779474286604437 | 3.708 |
| 1.8466968443395073 | -4.525 |
| -4.87230087818173 | 0.435 |
| 2.6305293336647244 | 4.129 |
| 2.4499999988371255 | -4.244 |
| -4.8998648793328154 | -0.205 |
| 2.097614847351018 | 4.438 |
| 2.9495643558288003 | -3.928 |
| -4.8561343414717255 | -0.769 |
| 1.6020666280140865 | 4.653 |
| 3.352550278621773 | -3.608 |
| -4.767823965071847 | -1.251 |
| 1.160034425973941 | 4.795 |
| 3.6692775748730018 | -3.304 |
| -4.658220035608504 | -1.65 |
| 0.7822234423285639 | 4.884 |
| 3.911267310408109 | -3.034 |
| -4.546709375295303 | -1.968 |
| 0.47523519096736433 | 4.936 |
| 4.089726210247542 | -2.811 |
| -4.448701743145667 | -2.208 |
| 0.24282406543051677 | 4.965 |
| 4.214431558128261 | -2.644 |
| -4.375776874136945 | -2.376 |
| 0.08697116016071452 | 4.983 |
| 4.292950858960431 | -2.539 |
| -4.335918976941261 | -2.473 |
| 0.008719371057261577 | 4.996 |
| 4.330127018207541 | -2.5 |
| -4.333735458819419 | -2.502 |
| 0.008741187672460063 | 5.008 |
| 4.327770196689029 | -2.529 |
| -4.370589286495097 | -2.463 |
| 0.08762562543395522 | 5.02 |
| 4.284516825121335 | -2.626 |
| -4.444604648668395 | -2.353 |
| 0.2458771760912098 | 5.027 |
| 4.195840749266318 | -2.788 |
| -4.550534142561852 | -2.17 |
| 0.4836216943868567 | 5.023 |
| 4.054228248837793 | -3.011 |
| -4.679504247952739 | -1.91 |
| 0.8000162249890226 | 4.995 |
| 3.8495551998867685 | -3.288 |
| -4.818686349688695 | -1.566 |
| 1.1923664666435234 | 4.929 |
| 3.56972811569972 | -3.607 |
| -4.950974565829743 | -1.134 |
| 1.654971453243891 | 4.806 |
| 3.2016674882959353 | -3.954 |
| -5.054789466172092 | -0.612 |
| 2.1777444468801863 | 4.607 |
| 2.7327166531128873 | -4.306 |
| -5.104166666666595 | 0 |
| 2.7447055005906913 | 4.308 |
| 2.1525455944517065 | -4.637 |
| -5.069326450204392 | 0.694 |
| 3.332506305414272 | 3.888 |
| 1.4555786401268094 | -4.914 |
| -4.917946222989203 | 1.457 |
| 3.9092299796908243 | 3.327 |
| 0.6438994859003514 | -5.097 |
| -4.6173584513513255 | 2.262 |
| 4.433800055563218 | 2.612 |
| -0.2695301762119305 | -5.143 |
| -4.137855069112927 | 3.073 |
| 4.856418894185478 | 1.739 |
| -1.2576624998716297 | -5.007 |
| -3.457174798349921 | 3.84 |
| 5.120511139004709 | 0.72 |
| -2.2766852054281994 | -4.647 |
| -2.5660630188757048 | 4.499 |
| 5.166637186537009 | -0.416 |
| -3.2645995298131956 | -4.031 |
| -1.4745129963877566 | 4.978 |
| 4.9387213217519665 | -1.614 |
| -4.1419555746977235 | -3.144 |
| -0.21792787967340296 | 5.2 |
| 4.392663779408293 | -2.798 |
| -4.815722063835944 | -1.995 |
| 1.1379805775353977 | 5.091 |
| 3.5069412422177972 | -3.868 |
| -5.1871571117769895 | -0.628 |
| 2.495142685294995 | 4.595 |
| 2.2941423333903694 | -4.704 |
| -5.164154243882958 | 0.873 |
| 3.7257739100447878 | 3.687 |
| 0.8115848998281162 | -5.183 |
| -4.677784251237622 | 2.383 |
| 4.6814967799246565 | 2.385 |
| -0.8316478386257236 | -5.192 |
| -3.7016146223537856 | 3.741 |
| 5.210167620515219 | 0.769 |
| -2.4745063636591844 | -4.654 |
| -2.2709460341475287 | 4.761 |
| 5.180407521668898 | -1.016 |
| -3.9139176181803874 | -3.549 |
| -0.49759770498758105 | 5.264 |
| 4.511887535488781 | -2.765 |
| -4.927336371059729 | -1.941 |
| 1.4252750508978091 | 5.105 |
| 3.206894470388408 | -4.225 |
| -5.3083252482783045 | 0.009 |
| 3.2340450929680853 | 4.215 |
| 1.3760545881343345 | -5.136 |
| -4.912247696227187 | 2.045 |
| 4.625462815237188 | 2.638 |
| -0.7508861502432902 | -5.276 |
| -3.704844641199836 | 3.836 |
| 5.308260616709894 | 0.558 |
| -2.838554080399359 | -4.525 |
| -1.8020550673389952 | 5.033 |
| 5.070560992992506 | -1.706 |
| -4.490382000162886 | -2.916 |
| 0.5135734923359982 | 5.334 |
| 3.8509522705268258 | -3.732 |
| -5.3243488972759945 | -0.673 |
| 2.814240971487552 | 4.574 |
| 1.7942118667043 | -5.067 |
| -5.070625686905596 | 1.796 |
| 4.594948459594056 | 2.805 |
| -0.7311676482581696 | -5.338 |
| -3.6702200171566672 | 3.95 |
| 5.385769016594264 | 0.329 |
| -3.174040363832682 | -4.369 |
| -1.3439615968035512 | 5.234 |
| 4.889579788642831 | -2.311 |
| -4.909375728116262 | -2.279 |
| 1.401936496059756 | 5.232 |
| 3.1092622638919276 | -4.44 |
| -5.403522779690851 | 0.482 |
| 3.859048811520622 | 3.819 |
| 0.41684005099071536 | -5.417 |
| -4.3990299058335 | 3.196 |
| 5.291312983927752 | 1.27 |
| -2.480821642285864 | -4.848 |
| -2.059232286444326 | 5.046 |
| 5.169286869001537 | -1.74 |
| -4.703059168351967 | -2.77 |
| 0.9954615598353798 | 5.371 |
| 3.395607864054958 | -4.284 |
| -5.464301909613878 | 0.267 |
| 3.81012256268861 | 3.932 |
| 0.42989046013322957 | -5.462 |
| -4.37918471229181 | 3.3 |
| 5.379238071109832 | 1.085 |
| -2.7706975357558825 | -4.741 |
| -1.6891807435188009 | 5.23 |
| 5.024500016259951 | -2.237 |
| -5.028306457215931 | -2.239 |
| 1.7113093350335364 | 5.236 |
| 2.7312159080701055 | -4.788 |
| -5.3838074696101375 | 1.203 |
| 4.522401912284466 | 3.167 |
| -0.7211572139269181 | -5.478 |
| -3.546681919734667 | 4.242 |
| 5.5267272931946785 | -0.27 |
| -3.9563924648248383 | -3.874 |
| -0.14506391992959555 | 5.54 |
| 4.153583600252076 | -3.675 |
| -5.525368903731081 | -0.522 |
| 3.4041879287134327 | 4.389 |
| 0.8599318952438687 | -5.491 |
| -4.584201923095808 | 3.151 |
| 5.445021644495087 | 1.157 |
| -2.9190381528578415 | -4.745 |
| -1.4147005391461815 | 5.393 |
| 4.874920860051977 | -2.713 |
| -5.339368221375909 | -1.632 |
| 2.536671919069475 | 4.978 |
| 1.811238228201353 | -5.29 |
| -5.059095266620234 | 2.391 |
| 5.248779141853761 | 1.952 |
| -2.2794199390723695 | -5.12 |
| -2.0554610446637414 | 5.218 |
| 5.162498152925103 | -2.202 |
| -5.200306452114938 | -2.122 |
| 2.160059961321169 | 5.189 |
| 2.152594305170919 | -5.197 |
| -5.200671867647528 | 2.154 |
| 5.2082759901274045 | 2.147 |
| -2.184619120513718 | -5.197 |
| -2.1042727381259954 | 5.235 |
| 5.177568335811733 | -2.251 |
| -5.274729410446846 | -2.025 |
| 2.3537209814541526 | 5.141 |
| 1.9073973352939646 | -5.327 |
| -5.085081146832257 | 2.491 |
| 5.3893202596489385 | 1.751 |
| -2.6622949891391197 | -5.007 |
| -1.5547185640703132 | 5.458 |
| 4.903367230097674 | -2.865 |
| -5.5286095749765805 | -1.317 |
| 3.097634513414235 | 4.77 |
| 1.0372238638534337 | -5.596 |
| -4.602175712455857 | 3.356 |
| 5.655053797758004 | 0.714 |
| -3.635972676493896 | -4.395 |
| -0.34848541105958003 | 5.698 |
| 4.143701092939288 | -3.932 |
| -5.71635321818367 | 0.06 |
| 4.238019629361722 | 3.843 |
| -0.5089198517001717 | -5.702 |
| -3.487695685322308 | 4.545 |
| 5.646231116895669 | -0.996 |
| -4.8443314737248135 | -3.074 |
| 1.5150710973056822 | 5.538 |
| 2.5996144319849983 | -5.124 |
| -5.36808745158053 | 2.061 |
| 5.371977371585301 | 2.062 |
| -2.6231794260997985 | -5.126 |
| -1.462280153556285 | 5.574 |
| 4.803179153549942 | -3.191 |
| -5.714671980335468 | -0.803 |
| 3.7505624807834193 | 4.391 |
| 0.09077520242549042 | -5.778 |
| -3.8847840732823764 | 4.284 |
| 5.7491448806569405 | -0.665 |
| -4.773064177025723 | -3.28 |
| 1.4511607756505391 | 5.611 |
| 2.5788840372729847 | -5.195 |
| -5.350647374811025 | 2.249 |
| 5.527177496554283 | 1.785 |
| -3.0370229093211782 | -4.956 |
| -0.9099271360924684 | 5.745 |
| 4.419591733310563 | -3.788 |
| -5.82492015232932 | 0.03 |
| 4.471933532245179 | 3.739 |
| -1.0129477052910312 | -5.745 |
| -2.9187499980304525 | 5.055 |
| 5.485875588537879 | -2.008 |
| -5.503679893984819 | -1.971 |
| 2.9778922841110953 | 5.035 |
| 0.9157934284908109 | -5.782 |
| -4.387632262762718 | 3.882 |
| 5.858562708442883 | -0.215 |
| -4.672975520470635 | -3.547 |
| 1.3804801579172683 | 5.706 |
| 2.529252691653616 | -5.303 |
| -5.3064493165731585 | 2.531 |
| 5.723164750671006 | 1.363 |
| -3.6084902802273513 | -4.652 |
| -0.09254227548896335 | 5.891 |
| 3.75021117191532 | -4.549 |
| -5.771070843841595 | 1.227 |
| 5.288431518792804 | 2.625 |
| -2.5249727116462295 | -5.342 |
| -1.3199663086116247 | 5.763 |
| 4.598113603794497 | -3.723 |
| -5.9199315616968855 | 0.103 |
| 4.738131602962123 | 3.557 |
| -1.5645472943829464 | -5.719 |
| -2.261017564132658 | 5.486 |
| 5.142025833772733 | -2.969 |
| -5.890834884975476 | -0.776 |
| 4.211670620168385 | 4.197 |
| -0.8075076583713229 | -5.895 |
| -2.9229227642134927 | 5.187 |
| 5.464149608915281 | -2.376 |
| -5.797755650937297 | -1.392 |
| 3.8032964740372437 | 4.597 |
| -0.29167383624770266 | -5.964 |
| -3.3325270241258034 | 4.959 |
| 5.6362105813384735 | -1.996 |
| -5.7218901238937505 | -1.749 |
| 3.569896440824062 | 4.807 |
| -0.031372152418608974 | -5.992 |
| -3.515790920266309 | 4.857 |
| 5.7063390970090575 | -1.854 |
| -5.710301834021296 | -1.855 |
| 3.5400881157699815 | 4.855 |
| -0.03148123502241741 | -6.012 |
| -3.485341718235793 | 4.904 |
| 5.692809756441339 | -1.96 |
| -5.776888903291567 | -1.711 |
| 3.7202121325067745 | 4.745 |
| -0.29472694694267365 | -6.026 |
| -3.2350542725619666 | 5.098 |
| 5.581772174624926 | -2.312 |
| -5.902522943592006 | -1.309 |
| 4.095099618445538 | 4.453 |
| -0.8216446972907608 | -5.998 |
| -2.7410002783138436 | 5.403 |
| 5.327828744296682 | -2.893 |
| -6.0334328321674855 | -0.634 |
| 4.623172143660431 | 3.935 |
| -1.6030287810086172 | -5.86 |
| -1.969147969031182 | 5.751 |
| 4.858366017903971 | -3.661 |
| -6.079157292683472 | 0.319 |
| 5.227045385363061 | 3.128 |
| -2.605102311241334 | -5.511 |
| -0.8911064716630425 | 6.035 |
| 4.084484741050333 | -4.536 |
| -5.9137685026560565 | 1.529 |
| 5.782946756678562 | 1.98 |
| -3.7489481469109154 | -4.833 |
| 0.49088425194396657 | 6.101 |
| 2.922597404278216 | -5.383 |
| -5.386416551767235 | 2.925 |
| 6.115256880527305 | 0.471 |
| -4.88870237347391 | -3.711 |
| 2.110643293398902 | 5.768 |
| 1.3302017914046707 | -6 |
| -4.348706702412685 | 4.349 |
| 6.0059544051828055 | -1.342 |
| -5.79788943936724 | -2.076 |
| 3.802483582658215 | 4.849 |
| -0.6445921928185089 | -6.133 |
| -2.7051152825619518 | 5.546 |
| 5.23097786310638 | -3.281 |
| -6.179081964164624 | 0.032 |
| 5.277789097895959 | 3.222 |
| -2.809066219552282 | -5.513 |
| -0.4857925650109958 | 6.173 |
| 3.6330653914040276 | -5.019 |
| -5.715551538792078 | 2.403 |
| 6.13761043282264 | 0.906 |
| -4.790502623606814 | -3.949 |
| 2.0737751155770794 | 5.856 |
| 1.2287697966642899 | -6.094 |
| -4.178661830709795 | 4.608 |
| 5.949811516308289 | -1.83 |
| -6.057054296455421 | -1.454 |
| 4.483884757367079 | 4.33 |
| -1.6773873837649553 | -6.008 |
| -1.5838725014271984 | 6.037 |
| 4.408756183226338 | -4.424 |
| -6.037036413584317 | 1.618 |
| 6.041061105973955 | 1.619 |
| -4.4330268197381 | -4.418 |
| 1.6525049781167853 | 6.041 |
| 1.558456623513216 | -6.07 |
| -4.356086862724598 | 4.511 |
| 6.016593835496434 | -1.782 |
| -6.120687999157233 | -1.402 |
| 4.654722215241327 | 4.221 |
| -2.0054566599048664 | -5.959 |
| -1.146565178422853 | 6.186 |
| 4.004642459631736 | -4.858 |
| -5.857591860041827 | 2.319 |
| 6.254456429895543 | 0.79 |
| -5.110012683492762 | -3.699 |
| 2.7176013012020057 | 5.698 |
| 0.3305887873881777 | -6.308 |
| -3.2932150454606157 | 5.395 |
| 5.460976856131091 | -3.191 |
| -6.324915958851056 | 0.232 |
| 5.692362294501448 | 2.776 |
| -3.725089038754998 | -5.127 |
| 0.8935486487621885 | 6.278 |
| 2.1391503246572667 | -5.974 |
| -4.674216501228658 | 4.298 |
| 6.137653687120914 | -1.645 |
| -6.207615445907836 | -1.376 |
| 4.881088280313053 | 4.081 |
| -2.467182569793271 | -5.869 |
| -0.48876413874133584 | 6.352 |
| 3.3309283475390576 | -5.436 |
| -5.4391337135594755 | 3.333 |
| 6.362771840574094 | -0.512 |
| -5.913998361599795 | -2.413 |
| 4.201723448284167 | 4.817 |
| -1.6013887788235088 | -6.192 |
| -1.3306348182987064 | 6.26 |
| 3.9779339071788473 | -5.019 |
| -5.793662337791286 | 2.739 |
| 6.411708905835788 | 0.101 |
| -5.717291864913387 | -2.913 |
| 3.8641539635725044 | 5.128 |
| -1.2369536378994754 | -6.305 |
| -1.631452115785717 | 6.219 |
| 4.169571361189144 | -4.899 |
| -5.880948882333075 | 2.618 |
| 6.43945926846389 | 0.169 |
| -5.748378244300355 | -2.916 |
| 3.9532504984832944 | 5.096 |
| -1.407932840177139 | -6.299 |
| -1.3978391703395776 | 6.305 |
| 3.9341207325208165 | -5.127 |
| -5.730783144264307 | 2.996 |
| 6.463108046895699 | -0.316 |
| -6.0077397451544945 | -2.415 |
| 4.459964023935935 | 4.7 |
| -2.1107668710068817 | -6.13 |
| -0.6105276795425905 | 6.459 |
| 3.2163525198577383 | -5.639 |
| -5.248567618973792 | 3.827 |
| 6.35795940411718 | -1.351 |
| -6.362035020427132 | -1.352 |
| 5.272021011749843 | 3.816 |
| -3.2857361528219005 | -5.623 |
| 0.7490071005277965 | 6.473 |
| 1.9065071548465466 | -6.236 |
| -4.237648512941211 | 4.962 |
| 5.86337171200619 | -2.872 |
| -6.525533430474654 | 0.319 |
| 6.127481007417221 | 2.279 |
| -4.74515734590489 | -4.503 |
| 2.6101449499533107 | 6.003 |
| -0.068590189175475 | -6.55 |
| -2.476431487295134 | 6.068 |
| 4.629341048754546 | -4.646 |
| -6.062959430867754 | 2.511 |
| 6.566666666666539 | 0 |
| -6.075037897096449 | -2.504 |
| 4.673506543003884 | 4.625 |
| -2.5812512826480742 | -6.052 |
| 0.11489501230710662 | 6.582 |
| 2.360748864582126 | -6.15 |
| -4.487085058818584 | 4.829 |
| 5.963177815734408 | -2.819 |
| -6.586976407420416 | 0.414 |
| 6.280935744051915 | 2.041 |
| -5.099152457318992 | -4.203 |
| 3.2158927059391895 | 5.778 |
| -0.8979847075511099 | -6.555 |
| -1.5343642411518992 | 6.441 |
| 3.7524413168857227 | -5.46 |
| -5.463269856853603 | 3.755 |
| 6.447341303051821 | -1.56 |
| -6.585161330394283 | -0.832 |
| 5.8696767280723545 | 3.108 |
| -4.403662406275779 | -4.977 |
| 2.3831468676168575 | 6.208 |
| -0.06968100017389156 | -6.654 |
| -2.2444925924931223 | 6.269 |
| 4.2736581677302405 | -5.111 |
| -5.773502690202363 | 3.333 |
| 6.569488385129462 | -1.158 |
| -6.575604752666729 | -1.148 |
| 5.8017346585408145 | 3.309 |
| -4.349341021317401 | -5.074 |
| 2.396585665773002 | 6.243 |
| -0.17516741585800774 | -6.689 |
| -2.0580086834190894 | 6.372 |
| 4.050814066839678 | -5.337 |
| -5.584042816024393 | 3.71 |
| 6.49465708667198 | -1.68 |
| -6.691807602955048 | -0.527 |
| 6.164251903886428 | 2.668 |
| -4.978824226544285 | -4.515 |
| 3.2706054363880948 | 5.876 |
| -1.2262932270510132 | -6.616 |
| -0.9370988763460432 | 6.668 |
| 2.9957295166241225 | -6.035 |
| -4.74205261895865 | 4.792 |
| 6.005227209509423 | -3.073 |
| -6.666896298466363 | 1.056 |
| 6.671011667654324 | 1.057 |
| -6.02706497251246 | -3.058 |
| 4.806781444549467 | 4.757 |
| -3.1349698407849806 | -5.997 |
| 1.175742873117743 | 6.668 |
| 0.8843149487667237 | -6.717 |
| -2.8542719482264833 | 6.149 |
| 4.556504661597346 | -5.025 |
| -5.842286506470066 | 3.455 |
| 6.604012375198484 | -1.585 |
| -6.783157734494491 | -0.415 |
| 6.373517529797552 | 2.37 |
| -5.4197223193972395 | -4.114 |
| 4.0114452025606315 | 5.501 |
| -2.2740592319384825 | -6.422 |
| 0.3567567720051016 | 6.807 |
| 1.5807138215554417 | -6.635 |
| -3.3815054088901606 | 5.928 |
| 4.90420417260781 | -4.753 |
| -6.033475216156459 | 3.208 |
| 6.688084219258187 | -1.422 |
| -6.825823274615842 | -0.465 |
| 6.445150439261274 | 2.308 |
| -5.583625402866961 | -3.968 |
| 4.313466849849777 | 5.327 |
| -2.7347540344297947 | -6.29 |
| 0.966934707826697 | 6.794 |
| 0.8606215334763284 | -6.813 |
| -2.6182710407430996 | 6.352 |
| 4.1852348214881365 | -5.454 |
| -5.4576098511558735 | 4.188 |
| 6.354763659693632 | -2.645 |
| -6.823775750739657 | 0.935 |
| 6.841752681912914 | 0.828 |
| -6.416004480580572 | -2.527 |
| 5.582217263395408 | 4.056 |
| -4.400881465454332 | -5.32 |
| 2.9523305763041887 | 6.246 |
| -1.3308080973170178 | -6.783 |
| -0.3619903602351352 | 6.907 |
| 2.0234558361432593 | -6.618 |
| -3.5562731672483543 | 5.942 |
| 4.873939125517671 | -4.925 |
| -5.905306741394562 | 3.633 |
| 6.597954580618392 | -2.144 |
| -6.92026782469709 | 0.545 |
| 6.862204568249529 | 1.075 |
| -6.434800565878016 | -2.626 |
| 5.668534548354361 | 4.028 |
| -4.6107311717229305 | -5.211 |
| 3.322217871699565 | 6.119 |
| -1.8734747540078258 | -6.71 |
| 0.34052360748732136 | 6.963 |
| 1.1992054706259025 | -6.871 |
| -2.6708114514565646 | 6.448 |
| 4.0054754439995515 | -5.72 |
| -5.143478393607188 | 4.73 |
| 6.036573889354985 | -3.527 |
| -6.649649637964693 | 2.173 |
| 6.961653267167374 | -0.732 |
| -6.965797109219563 | -0.732 |
| 6.669090781730204 | 2.154 |
| -6.091278496949452 | -3.474 |
| 5.263279341188191 | 4.64 |
| -4.2252429782060315 | -5.607 |
| 3.0243404586518703 | 6.341 |
| -1.712410524202397 | -6.817 |
| 0.34357671820574165 | 7.025 |
| 1.0280593095697947 | -6.962 |
| -2.3505566300121834 | 6.638 |
| 3.5760307122459314 | -6.071 |
| -4.662248647528384 | 5.288 |
| 5.5738851473443285 | -4.324 |
| -6.283418710713928 | 3.215 |
| 6.771664376362475 | -2.006 |
| -7.027954726847416 | 0.739 |
| 7.049993835847249 | 0.542 |
| -6.843419351917995 | -1.795 |
| 6.421115752879219 | 2.981 |
| -5.802326982708098 | -4.063 |
| 5.01161931454091 | 5.012 |
| -4.077745582410902 | -5.802 |
| 3.032460175977557 | 6.415 |
| -1.9093307303019817 | -6.838 |
| 0.742587628545437 | 7.065 |
| 0.4339533644292152 | -7.095 |
| -1.5878664461238925 | 6.933 |
| 2.688966929040007 | -6.589 |
| -3.7100227498748004 | 6.078 |
| 4.627317341209999 | -5.418 |
| -5.421060860406666 | 4.63 |
| 6.075652128044967 | -3.738 |
| -6.579798242853646 | 2.766 |
| 6.92650264147814 | -1.74 |
| -7.112935333765068 | 0.685 |
| 7.140201173713595 | 0.374 |
| -7.013023362598776 | -1.414 |
| 6.739359984692066 | 2.413 |
| -6.329971327480156 | -3.352 |
| 5.79795512882867 | 4.212 |
| -5.158265821192251 | -4.981 |
| 4.42723240746687 | 5.646 |
| -3.6220879029583233 | -6.198 |
| 2.7605214050162274 | 6.632 |
| -1.8602618907764914 | -6.943 |
| 0.9387008699323096 | 7.13 |
| -0.012559096299179515 | -7.196 |
| -0.9023992774356767 | 7.143 |
| 1.7916033913083715 | -6.978 |
| -2.641863005316863 | 6.707 |
| 3.4415075546027167 | -6.338 |
| -4.180479123577958 | 5.883 |
| 4.850382418879483 | -5.349 |
| -5.444495506548367 | 4.75 |
| 5.957745569469901 | -4.095 |
| -6.386654252980652 | 3.396 |
| 6.729257315019278 | -2.664 |
| -6.985003304186253 | 1.911 |
| 7.154635874062977 | -1.146 |
| -7.240064126742546 | 0.379 |
| 7.244225083594157 | 0.38 |
| -7.17094202638465 | -1.123 |
| 7.024782055645954 | 1.843 |
| -6.810915791837174 | -2.533 |
| 6.534981713558364 | 3.187 |
| -6.2029571979758344 | -3.801 |
| 5.821037912549715 | 4.371 |
| -5.395526812590164 | -4.892 |
| 4.932733632320171 | 5.364 |
| -4.43888542336724 | -5.785 |
| 3.920048396304395 | 6.153 |
| -3.3820610603198156 | -6.469 |
| 2.8304784334780817 | 6.733 |
| -2.270526910796571 | -6.947 |
| 1.7070692275381008 | 7.11 |
| -1.1445788402941948 | -7.227 |
| 0.587122962995249 | 7.297 |
| -0.0383534395587955 | -7.325 |
| -0.4984953966816473 | 7.312 |
| 1.0206027359115162 | -7.262 |
| -1.5255520269504281 | 7.177 |
| 2.0113172595510838 | -7.061 |
| -2.4762455815696764 | 6.916 |
| 2.9190369920095725 | -6.745 |
| -3.3387217961140663 | 6.553 |
| 3.734636450197204 | -6.34 |
| -4.106398361076878 | 6.111 |
| 4.453880142505702 | -5.868 |
| -4.777183767267376 | 5.613 |
| 5.07661499241737 | -5.35 |
| -5.352658376273828 | 5.079 |
| 5.605953149493442 | -4.805 |
| -5.837270151102923 | 4.528 |
| 6.047489991979983 | -4.25 |
| -6.237582565502689 | 3.974 |
| 6.408587985690297 | -3.7 |
| -6.561598999077335 | 3.43 |
| 6.697744886750818 | -3.166 |
| -6.81817684707121 | 2.908 |
| 6.924054828180874 | -2.658 |
| -7.016535761574512 | 2.416 |
| 7.096763133501025 | -2.183 |
| -7.16585782005452 | 1.96 |
| 7.224910103195966 | -1.748 |
| -7.274972779481208 | 1.546 |
| 7.317055269595503 | -1.356 |
| -7.352118635353319 | 1.178 |
| 7.381071410870784 | -1.011 |
| -7.404766156367813 | 0.857 |
| 7.423996645700906 | -0.715 |
| -7.43949560261121 | 0.586 |
| 7.451932905299067 | -0.469 |
| -7.4619141841555985 | 0.365 |
| 7.469979743320376 | -0.274 |
| -7.4766037429210614 | 0.196 |
| 7.482193585336505 | -0.131 |
| -7.487089455574004 | 0.078 |
| 7.491563972728472 | -0.039 |
| -7.495821916520762 | 0.013 |
| 7.499999999999979 | 0 |
| -7.504166666666646 | 0 |
| 7.508321897482154 | -0.013 |
| -7.512397020483338 | 0.039 |
| 7.51625452301325 | -0.079 |
| -7.51968787390389 | 0.131 |
| 7.522421370313578 | -0.197 |
| -7.524110031312627 | 0.276 |
| 7.524339567733297 | -0.368 |
| -7.522626465220626 | 0.473 |
| 7.518418224851941 | -0.592 |
| -7.511093813041945 | 0.723 |
| 7.499964379718503 | -0.868 |
| -7.484274310893293 | 1.025 |
| 7.463202688577405 | -1.195 |
| -7.435865237551961 | 1.378 |
| 7.401316844523645 | -1.573 |
| -7.358554740712976 | 1.78 |
| 7.306522443505715 | -1.999 |
| -7.244114556529308 | 2.229 |
| 7.170182530004673 | -2.469 |
| -7.083541484258683 | 2.719 |
| 6.982978198537421 | -2.978 |
| -6.8672603646566905 | 3.246 |
| 6.735147199828671 | -3.521 |
| -6.585401505426751 | 3.802 |
| 6.416803247519665 | -4.088 |
| -6.228164721003185 | 4.377 |
| 6.018347341164555 | -4.668 |
| -5.786280084684801 | 4.959 |
| 5.5309795754869535 | -5.249 |
| -5.251571780040769 | 5.534 |
| 4.9473152409126335 | -5.813 |
| -4.617625735701362 | 6.083 |
| 4.262102203558775 | -6.343 |
| -3.8805537290659884 | 6.588 |
| 3.473027318442122 | -6.816 |
| -3.0398361415383754 | 7.025 |
| 2.5815878492470774 | -7.21 |
| -2.0992125082891264 | 7.369 |
| 1.593989624561275 | -7.499 |
| -1.0675736568477958 | 7.596 |
| 0.5220173506997304 | -7.657 |
| 0.040207844101884535 | 7.679 |
| -0.6161950737623337 | -7.659 |
| 1.2025899551321282 | 7.593 |
| -1.7955839287215207 | -7.479 |
| 2.3909140279841132 | 7.315 |
| -2.983870020491722 | -7.098 |
| 3.569309875209258 | 6.827 |
| -4.1416844854204635 | -6.501 |
| 4.69507252538589 | 6.119 |
| -5.223226236583903 | -5.68 |
| 5.719628824030128 | 5.186 |
| -6.177563989979808 | -4.638 |
| 6.590197939740333 | 4.038 |
| -6.950673960364591 | -3.39 |
| 7.252219395540317 | 2.697 |
| -7.488264520752325 | -1.965 |
| 7.652572461094551 | 1.198 |
| -7.739378894626552 | -0.406 |
| 7.743539850464124 | -0.406 |
| -7.6606854498657135 | 1.227 |
| 7.48737695936699 | -2.048 |
| -7.221264038425389 | 2.859 |
| 6.861238583655738 | -3.648 |
| -6.407581113490058 | 4.404 |
| 5.862095219073484 | -5.114 |
| -5.228225249574691 | 5.766 |
| 4.511152125222202 | -6.348 |
| -3.7178620022683213 | 6.847 |
| 2.857182474961512 | -7.253 |
| -1.9397811146315092 | 7.555 |
| 0.9781214382279109 | -7.743 |
| 0.013628111100399291 | 7.808 |
| -1.0197358821160045 | -7.746 |
| 2.023102207817167 | 7.55 |
| -3.0055096743497764 | -7.22 |
| 3.9479286610820585 | 6.756 |
| -4.830876710103218 | -6.161 |
| 5.634828439802372 | 5.441 |
| -6.340670696646222 | -4.607 |
| 6.930195485192111 | 3.669 |
| -7.386620984698985 | -2.645 |
| 7.695128721874989 | 1.552 |
| -7.843402804507786 | -0.411 |
| 7.822155124970122 | -0.753 |
| -7.62561871882484 | 1.915 |
| 7.251990123672081 | -3.048 |
| -6.703800741234037 | 4.124 |
| 5.988196975480162 | -5.114 |
| -5.117109409884524 | 5.991 |
| 4.107292592897546 | -6.729 |
| -2.9802192008438415 | 7.303 |
| 1.7618154933813859 | -7.692 |
| -0.4820290877883282 | 7.881 |
| -0.8257748654152987 | -7.857 |
| 2.1255870875441554 | 7.613 |
| -3.379688441398635 | -7.15 |
| 4.549729061425517 | 6.474 |
| -5.5979286883996995 | -5.598 |
| 6.488366820728324 | 4.543 |
| -7.1883238156579425 | -3.337 |
| 7.669627224496999 | 2.012 |
| -7.909951834770949 | -0.609 |
| 7.894017543888261 | -0.83 |
| -7.614626726119185 | 2.256 |
| 7.073482574030597 | -3.62 |
| -6.28173234487049 | 4.873 |
| 5.260184791111073 | -5.967 |
| -4.039159466925461 | 6.857 |
| 2.6579371112191943 | -7.506 |
| -1.1637947884869067 | 7.881 |
| -0.38937337920292225 | -7.961 |
| 1.9428297246180815 | 7.735 |
| -3.4351197985132957 | -7.202 |
| 4.8044899394733 | 6.376 |
| -5.991512172525809 | -5.282 |
| 6.9418135224411275 | 3.96 |
| -7.608790256149372 | -2.458 |
| 7.956175163558067 | 0.836 |
| -7.960319003564918 | 0.837 |
| 7.612046815630499 | -2.488 |
| -6.917956846268737 | 4.043 |
| 5.901044977753298 | -5.426 |
| -4.600560995065939 | 6.57 |
| 3.071034539266129 | -7.414 |
| -1.3804473951602365 | 7.91 |
| -0.392426489940211 | -8.024 |
| 2.1614430639086537 | 7.741 |
| -3.8371517023164117 | -7.067 |
| 5.331330475722819 | 6.026 |
| -6.5617787590710295 | -4.663 |
| 7.4571160040832325 | 3.043 |
| -7.961309919251249 | -1.247 |
| 8.037646002753613 | -0.633 |
| -7.671855896261241 | 2.493 |
| 6.874146127828318 | -4.229 |
| -5.679912220912264 | 5.74 |
| 4.14898536041275 | -6.932 |
| -2.363337940730052 | 7.73 |
| 0.4232670400736111 | -8.076 |
| 1.5578235850754587 | 7.94 |
| -3.4598180411495587 | -7.319 |
| 5.163134321645718 | 6.241 |
| -6.556408562157749 | -4.764 |
| 7.5441357826198265 | 2.972 |
| -8.0537439371359 | -0.975 |
| 8.041569970997436 | -1.102 |
| -7.497236302451525 | 3.121 |
| 6.445995886133062 | -4.946 |
| -4.948723111771554 | 6.449 |
| 3.09937238863445 | -7.52 |
| -1.0198991820293257 | 8.073 |
| -1.1471708694726945 | -8.06 |
| 3.2481434629559427 | 7.47 |
| -5.128961191859935 | -6.334 |
| 6.64668790458856 | 4.724 |
| -7.680830530183438 | -2.75 |
| 8.143597926418426 | 0.555 |
| -7.988205404699808 | 1.698 |
| 7.214417620385995 | -3.836 |
| -5.870682479863764 | 5.689 |
| 4.052439020124159 | -7.105 |
| -1.8964703375063316 | 7.961 |
| -0.42850064800439475 | -8.176 |
| 2.734434527813023 | 7.722 |
| -4.828955150554599 | -6.622 |
| 6.531545331615309 | 4.958 |
| -7.689617657658783 | -2.86 |
| 8.193023137431851 | 0.501 |
| -7.985587969789676 | 1.917 |
| 7.072430318655339 | -4.183 |
| -5.522103006689598 | 6.09 |
| 3.463019559186586 | -7.46 |
| -1.0741217838211246 | 8.159 |
| -1.429703335743121 | -8.108 |
| 3.8164010949543923 | 7.3 |
| -5.858172334996109 | -5.797 |
| 7.353613799106593 | 3.731 |
| -8.148428810915256 | -1.291 |
| 8.1525441769901 | -1.291 |
| -7.3516740751468035 | 3.762 |
| 5.811798727391582 | -5.873 |
| -3.6756508088121285 | 7.405 |
| 1.1510775161237745 | -8.19 |
| 1.5079989798169604 | 8.136 |
| -4.026451676090389 | -7.234 |
| 6.136331410266864 | 5.564 |
| -7.60589146293696 | -3.291 |
| 8.266106226048619 | 0.651 |
| -8.03159146500179 | 2.077 |
| 6.913246294276908 | -4.593 |
| -5.0206918111186445 | 6.615 |
| 2.5536212266456815 | -7.906 |
| 0.21759588936695137 | 8.31 |
| -2.9804267865187706 | -7.764 |
| 5.414983804502243 | 6.318 |
| -7.231357360968418 | -4.125 |
| 8.205139763566697 | 1.432 |
| -8.20673127395217 | 1.447 |
| 7.2204868007387795 | -4.169 |
| -5.35075900492047 | 6.399 |
| 2.8133408380057814 | -7.857 |
| 0.0874394040273441 | 8.35 |
| -2.993865584718891 | -7.799 |
| 5.538399241335059 | 6.26 |
| -7.390490084746138 | -3.913 |
| 8.300693001836967 | 1.049 |
| -8.136123540768594 | 1.968 |
| 6.902056825911822 | -4.744 |
| -4.746012254692368 | 6.905 |
| 1.942819917742021 | -8.155 |
| 1.1383143704691356 | 8.31 |
| -4.0811644066336665 | -7.332 |
| 6.478431402325341 | 5.34 |
| -7.988874738972775 | -2.596 |
| 8.387582963073422 | -0.528 |
| -7.6018274354913995 | 3.593 |
| 5.7265643051270425 | -6.163 |
| -3.0162635689762705 | 7.858 |
| -0.14696381270202805 | -8.42 |
| 3.305440213672482 | 7.749 |
| -5.991447236662384 | -5.929 |
| 7.797004886071863 | 3.214 |
| -8.437500000000085 | 0 |
| 7.799083050986602 | -3.23 |
| -5.961673635820331 | 5.983 |
| 3.192754642224466 | -7.824 |
| 0.08853021512506105 | 8.454 |
| -3.3727525476617495 | -7.757 |
| 6.13848061945272 | 5.825 |
| -7.935654180120307 | -2.951 |
| 8.460720321390621 | -0.414 |
| -7.610783701514959 | 3.728 |
| 5.506778237829358 | -6.448 |
| -2.4802866217224944 | 8.113 |
| -0.9755290717412889 | -8.431 |
| 4.284280411595116 | 7.332 |
| -6.881978774403154 | -4.982 |
| 8.314254607695558 | 1.767 |
| -8.318330219778524 | 1.768 |
| 6.87464725801578 | -5.013 |
| -4.217591908908176 | 7.394 |
| 0.8014891280646953 | -8.479 |
| 2.774111989455135 | 8.057 |
| -5.868222762929312 | -6.184 |
| 7.913670051526104 | 3.181 |
| -8.52314570496693 | 0.417 |
| 7.565963054385609 | -3.955 |
| -5.199837200459822 | 6.777 |
| 1.8496568604872636 | -8.343 |
| 1.8651247209032302 | 8.344 |
| -5.242909093785345 | -6.759 |
| 7.632300527443791 | 3.872 |
| -8.559565845291182 | -0.224 |
| 7.8260394175480545 | -3.484 |
| -5.554927646551365 | 6.527 |
| 2.1759743678450185 | -8.294 |
| 1.651678044897285 | 8.419 |
| -5.165578954493783 | -6.855 |
| 7.651518529752703 | 3.899 |
| -8.590606734185387 | -0.135 |
| 7.771342913354907 | -3.673 |
| -5.341870904697789 | 6.74 |
| 1.7889068326229869 | -8.416 |
| 2.155354541956534 | 8.334 |
| -5.661644309903883 | -6.49 |
| 7.977918208541441 | 3.256 |
| -8.593064580770744 | 0.691 |
| 7.354021413720585 | -4.507 |
| -4.508727191769347 | 7.358 |
| 0.6623409354970577 | -8.608 |
| 3.3471658847635357 | 7.963 |
| -6.6295855250100795 | -5.543 |
| 8.44089256315533 | 1.871 |
| -8.355258395485983 | 2.239 |
| 6.370306869757731 | -5.858 |
| -2.9186831055219034 | 8.152 |
| -1.2205569290074703 | -8.576 |
| 5.094138859210362 | 7.011 |
| -7.793293379721508 | -3.801 |
| 8.669173815756427 | -0.318 |
| -7.493553879208379 | 4.379 |
| 4.524100296755724 | -7.412 |
| -0.45466861237794554 | 8.676 |
| -3.7418589565322566 | -7.845 |
| 7.043987102779871 | 5.099 |
| -8.631397902380932 | -1.09 |
| 8.092929493141343 | -3.204 |
| -5.539181162429795 | 6.72 |
| 1.5877270084065132 | -8.567 |
| 2.7802619865588065 | 8.261 |
| -6.460433421878436 | -5.858 |
| 8.504791421012616 | 1.948 |
| -8.369697266794734 | 2.479 |
| 6.066683096535846 | -6.282 |
| -2.1729278817188655 | 8.463 |
| -2.3066902524910424 | -8.432 |
| 6.195022169499012 | 6.173 |
| -8.451850982012182 | -2.265 |
| 8.455875668988611 | -2.266 |
| -6.182258501089285 | 6.204 |
| 2.2235539819923873 | -8.476 |
| 2.3575304348088597 | 8.444 |
| -6.309209504168346 | -6.093 |
| 8.532546053292878 | 2.048 |
| -8.391066173476228 | 2.581 |
| 5.899945837154761 | -6.507 |
| -1.7369138709684333 | 8.614 |
| -2.9347186447564937 | -8.287 |
| 6.7870812363240285 | 5.595 |
| -8.705596531210727 | -1.286 |
| 8.116236827416847 | -3.412 |
| -5.164963169258536 | 7.135 |
| 0.6914207733014186 | -8.785 |
| 4.002682913019406 | 7.856 |
| -7.529029328385138 | -4.596 |
| 8.824879029042537 | -0.046 |
| -7.479380626691346 | 4.692 |
| 3.8722784562212698 | -7.939 |
| 0.9237703019740018 | 8.789 |
| -5.455625535579945 | -6.958 |
| 8.328091530319636 | 2.982 |
| -8.636863341429379 | 1.931 |
| 6.260841286142723 | -6.261 |
| -1.9172942390605074 | 8.648 |
| -3.0456840507415395 | -8.323 |
| 7.062565277966925 | 5.361 |
| -8.844688790158092 | -0.681 |
| 7.799501871057764 | -4.235 |
| -4.236772151770786 | 7.803 |
| -0.7124337857639763 | -8.855 |
| 5.4472114456686365 | 7.023 |
| -8.4122756515127 | -2.88 |
| 8.612480048848472 | -2.227 |
| -5.9552623906112885 | 6.614 |
| 1.300747625500298 | -8.809 |
| 3.8070463069805482 | 8.054 |
| -7.64750347641895 | -4.577 |
| 8.90444668447114 | -0.467 |
| -7.124494274329445 | 5.369 |
| 2.890962949732446 | -8.444 |
| 2.356166449819862 | 8.613 |
| -6.803075552611789 | -5.79 |
| 8.888539440706564 | 0.934 |
| -7.8580896784883665 | 4.267 |
| 4.047405496429036 | -7.978 |
| 1.2146543814160544 | 8.867 |
| -6.060860251245648 | -6.591 |
| 8.745985065560617 | 1.939 |
| -8.280270306979268 | 3.43 |
| 4.804580254685373 | -7.571 |
| 0.43822315145344926 | 8.96 |
| -5.537896985888667 | -7.063 |
| 8.609402205020965 | 2.55 |
| -8.49390853477091 | 2.925 |
| 5.206289529665249 | -7.326 |
| 0.047080049759250016 | 8.992 |
| -5.300312238086333 | -7.269 |
| 8.559508649228437 | 2.781 |
| -8.563471379562646 | 2.782 |
| 5.2822376401579385 | -7.297 |
| 0.04718913239559533 | 9.012 |
| -5.375960962668729 | -7.239 |
| 8.62666582186984 | 2.637 |
| -8.507339454300068 | 3.013 |
| 5.035973539520441 | -7.494 |
| 0.4412762622350683 | 9.023 |
| -5.760719313855769 | -6.964 |
| 8.791844698900569 | 2.111 |
| -8.295572586168513 | 3.607 |
| 4.442678962823973 | -7.884 |
| 1.2287914204914085 | 8.97 |
| -6.416378369387085 | -6.394 |
| 8.984969057310112 | 1.183 |
| -7.851963656712938 | 4.533 |
| 3.4566258642499377 | -8.386 |
| 2.3946479366704914 | 8.753 |
| -7.260470300321701 | -5.451 |
| 9.081949897521262 | -0.159 |
| -7.062313919344645 | 5.719 |
| 2.029715629705482 | -8.862 |
| 3.88717590684049 | 8.223 |
| -8.150977022008115 | -4.046 |
| 8.905218779887129 | -1.893 |
| -5.79361244968749 | 7.028 |
| 0.14313292035254585 | -9.111 |
| 5.587669312647884 | 7.204 |
| -8.872526657843261 | -2.114 |
| 8.236090715949523 | -3.928 |
| -3.930207546760187 | 8.24 |
| -2.147631308124266 | -8.877 |
| 7.2782921312194455 | 5.525 |
| -9.13552706613983 | 0.335 |
| 6.849824190585984 | -6.06 |
| -1.4313753464749366 | 9.037 |
| -4.659849967571864 | -7.879 |
| 8.622301075864884 | 3.087 |
| -8.604451081799963 | 3.149 |
| 4.583333325707612 | -7.939 |
| 1.5924985047084734 | 9.032 |
| -7.038740273570314 | -5.885 |
| 9.17904084087509 | -0.048 |
| -6.972641499925262 | 5.976 |
| 1.437241638800465 | -9.074 |
| 4.802632648251978 | 7.837 |
| -8.750703541744533 | -2.826 |
| 8.481140991164605 | -3.565 |
| -4.092496287099598 | 8.244 |
| -2.3055825459634525 | -8.915 |
| 7.592262517744414 | 5.218 |
| -9.15558565525579 | 1.059 |
| 6.19382359407995 | -6.831 |
| -0.14489999322206593 | 9.224 |
| -5.993864286221557 | -7.018 |
| 9.143475169298204 | 1.285 |
| -7.694109956075991 | 5.112 |
| 2.345146329133762 | -8.939 |
| 4.211892296174454 | 8.231 |
| -8.635618948342344 | -3.315 |
| 8.6395088602919 | -3.316 |
| -4.188791342289367 | 8.257 |
| -2.4441241340609 | -8.934 |
| 7.824105447859291 | 4.965 |
| -9.129988541969604 | 1.61 |
| 5.64626224681596 | -7.358 |
| 0.8248650054252505 | 9.242 |
| -6.877136008348735 | -6.236 |
| 9.286990760386471 | -0.097 |
| -6.739936857679944 | 6.396 |
| 0.5674970395936347 | -9.278 |
| 5.928043111746046 | 7.166 |
| -9.230800534634886 | -1.166 |
| 7.521039163859441 | -5.484 |
| -1.6970683220712675 | 9.157 |
| -5.074220350642182 | -7.814 |
| 9.067081833620676 | 2.16 |
| -8.051163504732852 | 4.705 |
| 2.5558112021137878 | -8.972 |
| 4.381734594208995 | 8.241 |
| -8.880490223782175 | -2.885 |
| 8.389074266134218 | -4.11 |
| -3.1504360938837603 | 8.799 |
| -3.8922254161350405 | -8.501 |
| 8.732866909542764 | 3.352 |
| -8.582153859049804 | 3.732 |
| 3.492098105667247 | -8.687 |
| 3.6297293350879225 | 8.635 |
| -8.663766793553968 | -3.571 |
| 8.661370613688247 | -3.588 |
| -3.5892516840148194 | 8.665 |
| -3.605971119675681 | -8.663 |
| 8.691610118481556 | 3.547 |
| -8.638656891964942 | 3.685 |
| 3.4435844339432213 | -8.742 |
| 3.8233244535762765 | 8.587 |
| -8.81435604616307 | -3.278 |
| 8.505909983990472 | -4.021 |
| -3.0488726897856115 | 8.905 |
| -4.275077214383502 | -8.39 |
| 9.00918772459717 | 2.754 |
| -8.235303197454817 | 4.584 |
| 2.392725943220632 | -9.121 |
| 4.942933721164046 | 8.035 |
| -9.23126798392324 | -1.962 |
| 7.781124758798543 | -5.348 |
| -1.4613685143882544 | 9.332 |
| -5.791971664644512 | -7.467 |
| 9.412208741260745 | 0.89 |
| -7.083872852728085 | 6.267 |
| 0.24769936367647818 | -9.459 |
| 6.763674707307141 | 6.623 |
| -9.459526458597068 | 0.463 |
| 6.077735251650577 | -7.269 |
| 1.2372795400692724 | 9.398 |
| -7.768291892262277 | -5.439 |
| 9.259010276768345 | -2.07 |
| -4.702728519381371 | 8.245 |
| -2.950131605662583 | -9.026 |
| 8.678681851587644 | 3.864 |
| -8.682488283019278 | 3.866 |
| 2.9224491648902293 | -9.048 |
| 4.799319030037339 | 8.213 |
| -9.328914013762402 | -1.881 |
| 7.603675579301412 | -5.73 |
| -0.7473228769630939 | 9.496 |
| -6.63146903129576 | -6.843 |
| 9.521951842171005 | -0.466 |
| -5.924196946637449 | 7.474 |
| -1.738830648824179 | -9.382 |
| 8.224968365758665 | 4.845 |
| -9.051188312413034 | 3.046 |
| 3.6099538414979864 | -8.846 |
| 4.354250080526913 | 8.509 |
| -9.298287366138721 | -2.232 |
| 7.739595906973855 | -5.623 |
| -0.7342650217149678 | 9.543 |
| -6.805904969388792 | -6.735 |
| 9.541243371520169 | -0.852 |
| -5.496774173456802 | 7.85 |
| -2.4814276046502064 | -9.261 |
| 8.70006384132978 | 4.038 |
| -8.675425461806645 | 4.101 |
| 2.3874229069822532 | -9.298 |
| 5.645187535411634 | 7.77 |
| -9.590411855456372 | -0.587 |
| 6.5434293454338475 | -7.042 |
| 1.3051314316429503 | 9.528 |
| -8.211869967425129 | -5.013 |
| 9.07292434835851 | -3.213 |
| -3.214281872419542 | 9.077 |
| -5.047730902869461 | -8.205 |
| 9.56150543520077 | 1.208 |
| -6.923934380466933 | 6.71 |
| -0.9245121647154358 | -9.601 |
| 8.093170986274565 | 5.256 |
| -9.149914188355327 | 3.079 |
| 3.2557783612512243 | -9.093 |
| 5.134638783322189 | 8.185 |
| -9.613711656306688 | -1.01 |
| 6.717925316881965 | -6.957 |
| 1.3632194292361426 | 9.578 |
| -8.407629205310458 | -4.796 |
| 8.939752265055898 | -3.721 |
| -2.507309489400089 | 9.357 |
| -5.899912857727705 | -7.689 |
| 9.69581856572045 | -0.017 |
| -5.8646114058591845 | 7.726 |
| -2.609642769274813 | -9.347 |
| 9.032803892992488 | 3.558 |
| -8.281267590817238 | 5.075 |
| 0.9144191006461735 | -9.674 |
| 7.201238020120188 | 6.53 |
| -9.543071155299472 | 1.872 |
| 4.188514203201854 | -8.781 |
| 4.569523220414369 | 8.594 |
| -9.633039343771303 | -1.422 |
| 6.85223672237006 | -6.924 |
| 1.5413821742208234 | 9.623 |
| -8.687313615642173 | -4.426 |
| 8.691026133204037 | -4.428 |
| -1.5097155091392132 | 9.641 |
| -6.9391798711678 | -6.867 |
| 9.62989462694477 | -1.629 |
| -4.283251403828027 | 8.782 |
| -4.664226890919129 | -8.59 |
| 9.708339507569509 | 1.175 |
| -6.571666424272588 | 7.248 |
| -2.135076985624802 | -9.552 |
| 9.046320426610333 | 3.747 |
| -8.261722032160325 | 5.263 |
| 0.4103813958003735 | -9.791 |
| 7.809312077811692 | 5.928 |
| -9.322975131035573 | 3.047 |
| 2.786900559553692 | -9.408 |
| 6.177828513877613 | 7.629 |
| -9.789199234637886 | 0.788 |
| 4.867881407945192 | -8.534 |
| 4.3242354334567885 | 8.827 |
| -9.737636010803568 | -1.369 |
| 6.582572331975631 | -7.311 |
| 2.3975777515623777 | 9.545 |
| -9.269562076140753 | -3.319 |
| 7.907752124121059 | -5.873 |
| 0.515727246384631 | 9.841 |
| -8.494227478911064 | -5.003 |
| 8.856796961120011 | -4.339 |
| -1.2366212269531205 | 9.789 |
| -7.517017717767866 | -6.397 |
| 9.468344878697385 | -2.805 |
| -2.8058349156590587 | 9.472 |
| -6.431818522341635 | -7.504 |
| 9.796019271162763 | -1.342 |
| -4.164745910523706 | 8.972 |
| -5.317027383593519 | -8.346 |
| 9.900000000000253 | 0 |
| -5.306917872567056 | 8.362 |
| -4.234404173102517 | -8.958 |
| 9.840707153212296 | 1.191 |
| -6.240760535910816 | 7.707 |
| -3.229907409557225 | -9.38 |
| 9.674504854841155 | 2.216 |
| -6.9841232287024795 | 7.058 |
| -2.3357450010429814 | -9.655 |
| 9.45112413414798 | 3.071 |
| -7.559702634047694 | 6.457 |
| -1.573013788350496 | -9.821 |
| 9.212412323113679 | 3.76 |
| -7.9913789442452074 | 5.935 |
| -0.9544639634216415 | -9.912 |
| 8.99200590020374 | 4.289 |
| -8.301448359483027 | 5.515 |
| -0.4870729243032743 | -9.959 |
| 8.81556216544988 | 4.668 |
| -8.50863830084836 | 5.214 |
| -0.1742332023017139 | -9.982 |
| 8.701247944156037 | 4.903 |
| -8.626760537391007 | 5.041 |
| -0.01744602287074297 | -9.996 |
| 8.660254043550415 | 5 |
| -8.663862471298744 | 5.002 |
| -0.017467839519388212 | -10.008 |
| 8.697173043994768 | 4.961 |
| -8.6217659646409 | 5.099 |
| -0.17488766767531388 | -10.019 |
| 8.810141559928118 | 4.784 |
| -8.495926930404128 | 5.329 |
| -0.49012603515374653 | -10.021 |
| 8.990706798539678 | 4.463 |
| -8.27560047086395 | 5.688 |
| -0.9628504670743436 | -10 |
| 9.223433992729765 | 3.991 |
| -7.944350179805536 | 6.162 |
| -1.590806571272362 | -9.932 |
| 9.48533000800186 | 3.359 |
| -7.480991235336449 | 6.736 |
| -2.3680770420481236 | -9.788 |
| 9.74522261218412 | 2.557 |
| -6.861099083141265 | 7.383 |
| -3.282812235180955 | -9.534 |
| 9.963306137587795 | 1.578 |
| -6.059240764517792 | 8.07 |
| -4.314533773085279 | -9.127 |
| 10.091140584491912 | 0.423 |
| -5.052083323116928 | 8.75 |
| -5.431203550999055 | -8.525 |
| 10.072465272916542 | -0.899 |
| -3.8224892823624157 | 9.367 |
| -6.586377399578 | -7.684 |
| 9.845245441255706 | -2.364 |
| -2.3646069865060646 | 9.849 |
| -7.7169215240844276 | -6.568 |
| 9.345387694613136 | -3.928 |
| -0.6897883942767151 | 10.118 |
| -8.741945863034024 | -5.149 |
| 8.512506258136186 | -5.528 |
| 1.1670909941867347 | 10.087 |
| -9.56377162175374 | -3.424 |
| 7.29795849266937 | -7.072 |
| 3.141672787566342 | 9.669 |
| -10.071851484166974 | -1.416 |
| 5.67505647388716 | -8.445 |
| 5.135670781170186 | 8.789 |
| -10.150531577978729 | 0.817 |
| 3.650873474720736 | -9.511 |
| 7.015480392730931 | 7.393 |
| -9.691299976622537 | 3.168 |
| 1.2783989703269028 | -10.12 |
| 8.615662879647497 | 5.468 |
| -8.609621002805714 | 5.485 |
| -1.33299875012041 | -10.125 |
| 9.749155359985368 | 3.055 |
| -6.8655441809849815 | 7.572 |
| -4.011647028505648 | -9.405 |
| 10.225661387049678 | 0.268 |
| -4.485998057800978 | 9.198 |
| -6.525628104506677 | -7.888 |
| 9.878675557463792 | -2.702 |
| -1.5851368208154941 | 10.122 |
| -8.5963733281455 | -5.583 |
| 8.599867775430672 | -5.585 |
| 1.6224381854372398 | 10.129 |
| -9.926585315997261 | -2.604 |
| 6.37711720115905 | -8.046 |
| 4.8218641870533405 | 9.069 |
| -10.243325603135546 | 0.806 |
| 3.329601116132816 | -9.725 |
| 7.617940606839806 | 6.908 |
| -9.353766466642181 | 4.282 |
| -0.2694044387857239 | -10.288 |
| 9.57942421492143 | 3.773 |
| -7.20653239836309 | 7.359 |
| -3.993025200254732 | -9.499 |
| 10.308317632826265 | -0.018 |
| -3.9464228846779332 | 9.528 |
| -7.294984968110281 | -7.295 |
| 9.528298777629509 | -3.966 |
| 0.05406133915360902 | 10.325 |
| -9.583775310593557 | -3.853 |
| 7.178136485669551 | -7.433 |
| 4.204640059317256 | 9.444 |
| -10.334721138531455 | 0.379 |
| 3.4875313491858138 | -9.74 |
| 7.763649579052979 | 6.845 |
| -9.225630046773114 | 4.701 |
| -0.9928022658329315 | -10.311 |
| 9.966044323685436 | 2.839 |
| -6.26767748060531 | 8.257 |
| -5.434170510691282 | -8.833 |
| 10.20126966364942 | -1.891 |
| -1.8914528791056777 | 10.205 |
| -8.862702451711291 | -5.41 |
| 8.20773518319972 | -6.367 |
| 3.055569058623189 | 9.932 |
| -10.376443009377718 | -0.635 |
| 4.230061076241328 | -9.501 |
| 7.433492846689239 | 7.279 |
| -9.4099925322124 | 4.448 |
| -0.9256118789777571 | -10.371 |
| 10.061727360521859 | 2.696 |
| -5.977144436555446 | 8.536 |
| -5.994429763136834 | -8.529 |
| 10.059530073245583 | -2.752 |
| -0.8004351805133524 | 10.403 |
| -9.535130719428706 | -4.245 |
| 7.1875690184177765 | -7.574 |
| 4.7585461884030265 | 9.299 |
| -10.353314931156476 | 1.418 |
| 2.066342766430318 | -10.248 |
| 9.011204976258867 | 5.308 |
| -7.955747406594089 | 6.795 |
| -3.853036996938438 | -9.732 |
| 10.458332595771523 | -0.511 |
| -2.8697228031648305 | 10.074 |
| -8.636155692380164 | -5.935 |
| 8.372362255743893 | -6.309 |
| 3.345085768757987 | 9.94 |
| -10.491522849427128 | 0.055 |
| 3.2259638217555797 | -9.988 |
| 8.494678448722901 | 6.172 |
| -8.498049337288382 | 6.174 |
| -3.2646914939727703 | -9.988 |
| 10.512355897181902 | -0.055 |
| -3.144912319204894 | 10.035 |
| -8.618162140259958 | -6.035 |
| 8.350043898456471 | -6.407 |
| 3.618450213452516 | 9.888 |
| -10.52075797934371 | 0.515 |
| 2.6205696730491805 | -10.206 |
| 8.988248406225868 | 5.508 |
| -7.898362196603646 | 6.988 |
| -4.391762370551867 | -9.592 |
| 10.456517831153358 | -1.432 |
| -1.63348381537344 | 10.431 |
| -9.533557071747744 | -4.547 |
| 7.070480063842269 | -7.853 |
| 5.538967692516195 | 9.003 |
| -10.20019469662547 | 2.79 |
| 0.1661703142003317 | -10.578 |
| 10.120892004566647 | 3.094 |
| -5.766365771838624 | 8.879 |
| -6.962699488604356 | -7.981 |
| 9.579508009967883 | -4.528 |
| 1.7677487285953402 | 10.452 |
| -10.546075933560195 | -1.108 |
| 3.887967167465339 | -9.87 |
| 8.486653446394921 | 6.372 |
| -8.388812372995567 | 6.507 |
| -4.081536585400197 | -9.805 |
| 10.534101650308413 | -1.387 |
| -1.3873846378748895 | 10.538 |
| -9.831006162653429 | -4.052 |
| 6.431423073395517 | -8.473 |
| 6.566290115463931 | 8.374 |
| -9.762868703058759 | 4.245 |
| -1.6660270663096124 | -10.519 |
| 10.606883099176253 | 1.003 |
| -3.5928736163378563 | 10.035 |
| -8.850005997556089 | -5.947 |
| 7.926878129147282 | -7.137 |
| 5.009652813475849 | 9.422 |
| -10.353383759777008 | 2.601 |
| -0.05591574433107081 | -10.679 |
| 10.39248896876648 | 2.476 |
| -4.852023453542358 | 9.523 |
| -8.130007124623026 | -6.944 |
| 8.642125124956943 | -6.302 |
| 4.14641678794596 | 9.864 |
| -10.554265911134847 | 1.785 |
| 0.6537280968338987 | -10.688 |
| 10.271356413764426 | 3.043 |
| -5.260851880665607 | 9.337 |
| -7.942042618824869 | -7.201 |
| 8.774655711272485 | -6.167 |
| 4.1058743394534645 | 9.912 |
| -10.570269879875129 | 1.864 |
| 0.4496398177780721 | -10.728 |
| 10.390067781330146 | 2.726 |
| -4.861787967835132 | 9.583 |
| -8.354319094598523 | -6.765 |
| 8.3575571848921 | -6.768 |
| 4.900903972992192 | 9.577 |
| -10.381049212387348 | 2.84 |
| -0.6760446078453421 | -10.745 |
| 10.666012325723987 | 1.499 |
| -3.596768894782113 | 10.157 |
| -9.249224636967282 | -5.536 |
| 7.243387010915932 | -7.988 |
| 6.431775850200159 | 8.66 |
| -9.740399520756677 | 4.646 |
| -2.7030608077066454 | -10.452 |
| 10.778688666122063 | -0.678 |
| -1.3541211300152292 | 10.719 |
| -10.285149519701685 | -3.322 |
| 5.15927908260882 | -9.502 |
| 8.40612882552133 | 6.807 |
| -8.215948262039419 | 7.042 |
| -5.46151154032551 | -9.346 |
| 10.169608166657351 | -3.722 |
| 1.881188605685471 | 10.669 |
| -10.83750000000036 | 0 |
| 1.8639979811829657 | -10.68 |
| 10.211032622190709 | 3.656 |
| -5.326305714023753 | 9.453 |
| -8.435271799183194 | -6.831 |
| 8.132410858534788 | -7.195 |
| 5.772317082421606 | 9.202 |
| -10.017579574905344 | 4.211 |
| -2.5561907354674234 | -10.566 |
| 10.841476003195204 | -0.853 |
| -0.8535695642774014 | 10.846 |
| -10.58704414459315 | -2.522 |
| 4.113741552833144 | -10.08 |
| 9.34575693908321 | 5.593 |
| -6.9306022636972475 | 8.407 |
| -7.293523620310308 | -8.1 |
| 9.082312020708438 | -6.034 |
| 4.661762039858684 | 9.862 |
| -10.430091269618892 | 3.209 |
| -1.707742924710139 | -10.782 |
| 10.919170037260809 | -0.191 |
| -1.3124949494822395 | 10.846 |
| -10.571430485166848 | -2.773 |
| 4.166369434299353 | -10.108 |
| 9.472152861369883 | 5.469 |
| -6.660864623870774 | 8.681 |
| -7.7533698176754475 | -7.726 |
| 8.652197376310033 | -6.711 |
| 5.576124521288946 | 9.429 |
| -10.049449975805896 | 4.37 |
| -3.113518230758495 | -10.511 |
| 10.81308987069322 | -1.829 |
| 0.535922697856633 | 10.958 |
| -10.949584961248776 | -0.746 |
| 2.0007941920854457 | -10.795 |
| 10.503413907423887 | 3.211 |
| -4.363662434438418 | 10.084 |
| -9.547708070386436 | -5.446 |
| 6.447652693638232 | -8.907 |
| 8.174593090428715 | 7.36 |
| -8.177689506838533 | 7.363 |
| -6.4860699128511206 | -8.895 |
| 9.508143493356794 | -5.556 |
| 4.586026741971364 | 10.017 |
| -10.420402630273614 | 3.588 |
| -2.5737351514069666 | -10.72 |
| 10.919135922740631 | -1.554 |
| 0.5389758087460225 | 11.02 |
| -11.027818237860442 | -0.462 |
| 1.441226690502672 | -10.947 |
| 10.784002981978881 | 2.391 |
| -3.304400739718464 | 10.544 |
| -10.234727762090442 | -4.177 |
| 5.003173813363981 | -9.862 |
| 9.432331826255382 | 5.78 |
| -6.50482344616154 | 8.953 |
| -8.43086368973251 | -7.175 |
| 7.790096322592293 | -7.872 |
| 7.283169922405409 | 8.349 |
| -8.851543560320653 | 6.67 |
| -6.0386853137878465 | -9.299 |
| 9.691590232914113 | -5.394 |
| 4.741891639960439 | 10.032 |
| -10.320518987610065 | 4.086 |
| -3.4313762232513825 | -10.561 |
| 10.754506701279018 | -2.781 |
| 2.1394003684164304 | 10.905 |
| -11.01381349111185 | 1.509 |
| -0.8918788866448137 | -11.085 |
| 11.121187739941332 | -0.291 |
| -0.29132760479056613 | 11.125 |
| -11.100520642670972 | -0.854 |
| 1.395898873167487 | -11.05 |
| 10.975759744959255 | 1.916 |
| -2.4123998482336275 | 10.882 |
| -10.770072967222468 | -2.886 |
| 3.335550821823026 | -10.644 |
| 10.505242167878569 | 3.761 |
| -4.1634761082525635 | 10.357 |
| -10.201257616815242 | -4.542 |
| 4.896971004595676 | -10.04 |
| 9.876080923699933 | 5.229 |
| -5.538815016979204 | 9.711 |
| -9.545543091194224 | -5.827 |
| 6.093149190808976 | -9.383 |
| 9.223345603406745 | 6.339 |
| -6.56492716429213 | 9.069 |
| -8.921135091575215 | -6.772 |
| 6.959443242275817 | -8.781 |
| 8.648625549044027 | 7.129 |
| -7.281936229660851 | 8.526 |
| -8.4137458416898 | -7.418 |
| 7.53726476739422 | -8.312 |
| 8.222794049895905 | 7.641 |
| -7.729648244494293 | 8.145 |
| -8.080583768387 | -7.803 |
| 7.8624667774282235 | -8.029 |
| 7.990570763533816 | 7.907 |
| -7.938114027076695 | 7.966 |
| -7.954951299859601 | -7.955 |
| 7.95789755508305 | -7.958 |
| 7.974726017901364 | 7.947 |
| -7.921982828806428 | 8.005 |
| -8.049725535298832 | -7.883 |
| 7.829378705276987 | -8.108 |
| 8.178596044435997 | 7.761 |
| -7.677964122453655 | 8.262 |
| -8.358745205793488 | -7.579 |
| 7.464557667510942 | -8.467 |
| 8.586250705586862 | 7.333 |
| -7.185033550502796 | 8.716 |
| -8.855736078019742 | -7.019 |
| 6.834489147770917 | -9.004 |
| 9.160220893737092 | 6.631 |
| -6.407470541574658 | 9.323 |
| -9.49095526960911 | -6.163 |
| 5.898263192986541 | -9.663 |
| 9.837251909235743 | 5.611 |
| -5.301254839376507 | 10.012 |
| -10.186332532021385 | -4.968 |
| 4.611376675645362 | -10.357 |
| 10.523209519192251 | 4.23 |
| -3.8246266037981114 | 10.682 |
| -10.830627733654097 | -3.394 |
| 2.9386745584443936 | -10.967 |
| 11.089095484495395 | 2.458 |
| -1.9535443853989602 | 11.193 |
| -11.277037107046855 | -1.425 |
| 0.8723592655658103 | -11.337 |
| 11.371102072038022 | 0.298 |
| 0.29787187444171237 | 11.375 |
| -11.34666623174234 | 0.913 |
| -1.5454610978116887 | -11.282 |
| 11.178558927391459 | -2.193 |
| 2.853288812587182 | 11.033 |
| -10.842044280532244 | 3.523 |
| -4.198153768675035 | -10.603 |
| 10.314075080127306 | -4.875 |
| 5.550302543935931 | 9.972 |
| -9.574822308121226 | 6.218 |
| -6.873229090511865 | -9.121 |
| 8.609461745842186 | -7.511 |
| 8.123845665470252 | 8.039 |
| -7.410170855816411 | 8.707 |
| -9.253131883210289 | -6.723 |
| 5.978254396696497 | -9.756 |
| 10.207365898692363 | 5.178 |
| -4.326276993180687 | 10.601 |
| -10.930027768012732 | -3.425 |
| 2.4800372262550017 | -11.187 |
| 11.364436725744843 | 1.496 |
| -0.48017414554738996 | 11.457 |
| -11.457138732911586 | 0.56 |
| -1.6168416535822325 | -11.361 |
| 11.161996373860426 | -2.68 |
| 3.7386076567044273 | 10.858 |
| -10.444849795465327 | 4.782 |
| -5.797863291987537 | -9.922 |
| 9.288517030081458 | -6.773 |
| 7.695001986048487 | 8.546 |
| -7.697790004387336 | 8.549 |
| -9.322229222351554 | -6.748 |
| 5.7039679051896215 | -10 |
| 10.569474112727901 | 4.574 |
| -3.368365664777141 | 11.017 |
| -11.33201281286272 | -2.1 |
| 0.7841596044855388 | -11.502 |
| 11.519564116481895 | -0.563 |
| 1.9240944325498803 | 11.376 |
| -11.06637776828474 | 3.278 |
| -4.603890307759924 | -10.588 |
| 9.941570402933552 | -5.879 |
| 7.081630263003416 | 9.13 |
| -8.15869889193168 | 8.187 |
| -9.17314800786628 | -7.039 |
| 5.783333318019706 | -10.017 |
| 10.697768070667959 | 4.409 |
| -2.937248191419839 | 11.196 |
| -11.49530272389091 | -1.391 |
| -0.20215705899038094 | -11.582 |
| 11.44483864386451 | -1.813 |
| 3.4084174536628344 | 11.079 |
| -10.483590557824447 | 4.956 |
| -6.41934198608343 | -9.662 |
| 8.623576400367574 | -7.765 |
| 8.957275383538851 | 7.384 |
| -5.963497774165898 | 9.964 |
| -10.755529966981957 | -4.389 |
| 2.693103744406788 | -11.304 |
| 11.589164006057352 | 0.912 |
| 0.9124139186581489 | 11.593 |
| -11.30714630250167 | 2.735 |
| -4.5097126539540655 | -10.728 |
| 9.86191102517307 | -6.186 |
| 7.716762658370852 | 8.722 |
| -7.3315825416870055 | 9.054 |
| -10.153270965980356 | -5.721 |
| 3.929968870730814 | -10.976 |
| 11.488837519399235 | 2.005 |
| 1.8158346236508517e-08 | 11.667 |
| -11.493527147625613 | 2.027 |
| -4.012226951368762 | -10.964 |
| 10.083740525612036 | -5.892 |
| 7.603212118894916 | 8.871 |
| -7.35518205621904 | 9.083 |
| -10.274836750923614 | -5.579 |
| 3.594791758282093 | -11.13 |
| 11.607742007672906 | 1.466 |
| 0.7349107239595221 | 11.681 |
| -11.33539528483303 | 2.932 |
| -5.04236123795118 | -10.572 |
| 9.406344740038696 | -6.986 |
| 8.682847218000141 | 7.873 |
| -6.02127116458411 | 10.061 |
| -11.056399162091529 | -3.915 |
| 1.6329643663163145 | -11.619 |
| 11.714338723767383 | -0.737 |
| 3.098309412850747 | 11.326 |
| -10.456291225729707 | 5.351 |
| -7.394514609241403 | -9.131 |
| 7.397136748713184 | -9.135 |
| 10.486052627349135 | 5.32 |
| -2.9848278051852906 | 11.377 |
| -11.756345301609802 | -0.493 |
| -2.043983776307417 | -11.592 |
| 10.87868148818397 | -4.506 |
| 6.7730827133058495 | 9.637 |
| -7.915107597009337 | 8.729 |
| -10.269432807769503 | -5.787 |
| 3.3490142549992736 | -11.306 |
| 11.773831727529718 | 0.72 |
| 1.9678712297591943 | 11.635 |
| -10.881826277930221 | 4.574 |
| -6.95742700161273 | -9.541 |
| 7.671605056585172 | -8.982 |
| 10.528727102719223 | 5.365 |
| -2.7394533241739225 | 11.499 |
| -11.824837905727312 | 0.062 |
| -2.8817625952743984 | -11.473 |
| 10.448213173273501 | -5.555 |
| 7.920833566865335 | 8.797 |
| -6.604631649749429 | 9.829 |
| -11.152503168493073 | -3.993 |
| 1.11518349388503 | -11.797 |
| 11.708222201161282 | -1.854 |
| 4.728499393145665 | 10.875 |
| -9.335016686252475 | 7.32 |
| -9.452155038762552 | -7.175 |
| 4.523622908261799 | -10.975 |
| 11.77340773131165 | 1.55 |
| 1.5505424107543375 | 11.778 |
| -10.970814739322527 | 4.567 |
| -7.2859326154709345 | -9.393 |
| 7.139997164137732 | -9.51 |
| 11.068092326169483 | 4.36 |
| -1.2438886937416942 | 11.835 |
| -11.73746115474608 | 1.985 |
| -5.0891199072976 | -10.766 |
| 8.976823898091883 | -7.831 |
| 9.994157611884425 | 6.49 |
| -3.4853143448754045 | 11.4 |
| -11.923528842648624 | -0.187 |
| -3.147785610580774 | -11.506 |
| 10.163941403934158 | -6.253 |
| 8.87129136715366 | 7.988 |
| -5.1410199968210515 | 10.778 |
| -11.802003899517752 | -1.848 |
| -1.6218011098999117 | -11.839 |
| 10.869159978768803 | -4.976 |
| 7.923831424553704 | 8.956 |
| -6.250389063726183 | 10.2 |
| -11.590711833039228 | -2.976 |
| -0.5847724721670493 | -11.957 |
| 11.245653662086447 | -4.115 |
| 7.292454633919888 | 9.504 |
| -6.873357612829594 | 9.816 |
| -11.438955943974467 | -3.585 |
| -0.06278795264971053 | -11.992 |
| 11.402228291192127 | -3.727 |
| 7.053423043486508 | 9.708 |
| -7.055872116736444 | 9.712 |
| -11.4270628060042 | -3.691 |
| -0.06289703534323132 | -12.012 |
| 11.389017053957213 | -3.833 |
| 7.234318106663922 | 9.6 |
| -6.811034982646337 | 9.91 |
| -11.568946508237126 | -3.296 |
| -0.58782558309813 | -12.019 |
| 11.19218444154614 | -4.431 |
| 7.8204369304916375 | 9.157 |
| -6.1137225132849835 | 10.379 |
| -11.812267658145524 | -2.382 |
| -1.6359381492150546 | -11.943 |
| 10.734482726473045 | -5.493 |
| 8.749828364143745 | 8.303 |
| -4.9079554747830265 | 11.023 |
| -12.03525759821568 | -0.926 |
| -3.186267097738485 | -11.647 |
| 9.88256678348132 | -6.946 |
| 9.898087213386981 | 6.931 |
| -3.128475188181959 | 11.676 |
| -12.0437965474615 | 1.075 |
| -5.169249507509279 | -10.936 |
| 8.465926405745398 | -8.645 |
| 11.057706485122514 | 4.923 |
| -0.7391960459582919 | 12.086 |
| -11.577042885778033 | 3.562 |
| -7.426390482835177 | -9.574 |
| 6.315070895224981 | -10.346 |
| 11.921965757924522 | 2.21 |
| 2.2103650813455498 | 11.926 |
| -10.334286790238986 | 6.358 |
| -9.66788189237522 | -7.338 |
| 3.3263214939570385 | -11.677 |
| 12.089916324039473 | -1.164 |
| 5.515984590112119 | 10.826 |
| -8.037694614397422 | 9.117 |
| -11.446712714262938 | -4.099 |
| -0.4456791276972773 | -12.154 |
| 11.11480305961111 | -4.949 |
| 8.754964834266028 | 8.455 |
| -4.541126233723576 | 11.296 |
| -12.178999717555776 | 0.064 |
| -4.681998033486311 | -11.248 |
| 8.617863881084308 | -8.618 |
| 11.263631308461719 | 4.666 |
| 0.02128575459968867 | 12.196 |
| -11.246730441339768 | 4.728 |
| -8.719543675552831 | -8.539 |
| 4.474369123585498 | -11.359 |
| 12.208315080719666 | -0.32 |
| 5.08556369774211 | 11.108 |
| -8.208985353231032 | 9.053 |
| -11.565893518431109 | -3.96 |
| -0.9594893789996365 | -12.191 |
| 10.80139220948872 | -5.743 |
| 9.590448697025584 | 7.601 |
| -3.1064201513559992 | 11.841 |
| -12.09170490518389 | 1.937 |
| -6.671828196548029 | -10.274 |
| 6.674097490597983 | -10.277 |
| 12.11074135781423 | 1.896 |
| 3.235743295530403 | 11.828 |
| -9.451629097940108 | 7.819 |
| -11.028951952386423 | -5.379 |
| 0.3213220193320185 | -12.271 |
| 11.294641460894772 | -4.818 |
| 9.099549805283086 | 8.251 |
| -3.6744637146267993 | 11.725 |
| -12.186509751615313 | 1.604 |
| -6.606546452217475 | -10.37 |
| 6.590669560281341 | -10.385 |
| 12.207144640092128 | 1.542 |
| 3.8239090749662368 | 11.699 |
| -8.931171928403419 | 8.475 |
| -11.498598927339858 | -4.414 |
| -0.9881176014872082 | -12.281 |
| 10.641350150432256 | -6.218 |
| 10.233359810271338 | 6.877 |
| -1.7164682239436195 | 12.213 |
| -11.7336597631583 | 3.812 |
| -8.588723780039468 | -8.863 |
| 4.161721857713131 | -11.623 |
| 12.268153652690035 | -1.419 |
| 6.728561429820318 | 10.361 |
| -6.272328250335588 | 10.648 |
| -12.333871898575461 | -0.841 |
| -4.792276105716317 | -11.4 |
| 8.017783259595689 | -9.421 |
| 12.033077769978572 | 2.889 |
| 2.8898590878160655 | 12.037 |
| -9.402309675046842 | 8.059 |
| -11.46922187753966 | -4.681 |
| -1.101548517003363 | -12.343 |
| 10.454539785366071 | -6.66 |
| 10.73871501782563 | 6.2 |
| -0.519432566348403 | 12.393 |
| -11.21815762770532 | 5.303 |
| -9.926085836594225 | -7.453 |
| 1.9423945859733434 | -12.264 |
| 11.744128633955604 | -4.044 |
| 9.101845532353764 | 8.458 |
| -3.1539997649970637 | 12.022 |
| -12.08471510202922 | 2.924 |
| -8.322311932925148 | -9.243 |
| 4.153113652881346 | -11.728 |
| 12.28918766636918 | -1.968 |
| 7.630692835402881 | 9.837 |
| -4.946146001020936 | 11.43 |
| -12.40097763587212 | 1.194 |
| -7.058837745905512 | -10.271 |
| 5.543118547342622 | -11.167 |
| 12.455944870013006 | -0.609 |
| 6.629197298287646 | 10.568 |
| -5.954543676226759 | 10.967 |
| -12.481432060814884 | 0.218 |
| -6.3566546983488434 | -10.749 |
| 6.18910451382239 | -10.851 |
| 12.495814301057228 | -0.022 |
| 6.250000019330876 | 10.825 |
| -6.252083313984622 | 10.829 |
| -12.508314282018574 | 0.022 |
| -6.3129019123067565 | -10.803 |
| 6.1444786298880025 | -10.905 |
| 12.518926349379917 | -0.219 |
| 6.544294542217993 | 10.679 |
| -5.862770611317023 | 11.073 |
| -12.518370253580187 | 0.612 |
| -6.938146567397861 | -10.443 |
| 5.399326652121413 | -11.32 |
| 12.488074803184345 | -1.202 |
| 7.482622198951651 | 10.075 |
| -4.743476190234692 | 11.624 |
| -12.400271719534425 | 1.986 |
| -8.158691124374094 | -9.553 |
| 3.8833135410909865 | -11.952 |
| 12.218359739433366 | -2.956 |
| 8.938303399936416 | 8.845 |
| -2.808300395479607 | 12.262 |
| -11.897775402213554 | 4.097 |
| -9.782324804185292 | -7.922 |
| 1.5127230063439734 | -12.5 |
| 11.387673105348792 | -5.383 |
| 10.638531873579836 | 6.751 |
| 2.288193106138777e-08 | 12.604 |
| -10.63376046698303 | 6.774 |
| -11.440092639903158 | -5.31 |
| -1.7122781616193141 | -12.5 |
| 9.582636609707148 | -8.213 |
| 12.10509915923812 | 3.586 |
| 3.5868771462334514 | 12.109 |
| -8.187914732536957 | 9.621 |
| -12.537849540752703 | -1.584 |
| -5.561564359673293 | -11.353 |
| 6.418245528365999 | -10.896 |
| 12.632663613434527 | -0.662 |
| 7.544728957216864 | 10.159 |
| -4.267064124385961 | 11.917 |
| -12.281004387889185 | 3.085 |
| -9.413167804928118 | -8.476 |
| 1.763439143724787 | -12.548 |
| 11.3824995125257 | -5.576 |
| 11.013523755023101 | 6.282 |
| 1.0171897134653525 | 12.642 |
| -9.860039371293317 | 7.985 |
| -12.169020475009757 | -3.605 |
| -3.9442961934112333 | -12.068 |
| 7.678408740099172 | -10.116 |
| 12.693022955028969 | 0.532 |
| 6.828182542529128 | 10.718 |
| -4.864863112258534 | 11.745 |
| -12.41040815085916 | 2.774 |
| -9.423651817732257 | -8.545 |
| 1.5287412507953042 | -12.633 |
| 11.186609485340773 | -6.074 |
| 11.444644199882637 | 5.582 |
| 2.1242169345911392 | 12.559 |
| -8.962420821513323 | 9.057 |
| -12.592371792782298 | -1.972 |
| -5.788378892782323 | -11.36 |
| 5.790270477638651 | -11.364 |
| 12.597754480709153 | -2.018 |
| 9.071578302006959 | 8.977 |
| -1.8649933077841172 | 12.63 |
| -11.275976539300826 | 5.996 |
| -11.530527017830176 | -5.5 |
| -2.460270320624579 | -12.54 |
| 8.586828182501016 | -9.47 |
| 12.730748624611552 | 1.203 |
| 6.683627494057211 | 10.907 |
| -4.68968859135289 | 11.905 |
| -12.328480848565158 | 3.442 |
| -10.19890183987064 | -7.741 |
| -0.022354771504292853 | -12.808 |
| 10.16483965784771 | -7.8 |
| 12.379949346502938 | 3.317 |
| 4.926986304827788 | 11.836 |
| -6.354257401700313 | 11.14 |
| -12.701178505391006 | 1.808 |
| -9.231527454461968 | -8.915 |
| 1.341884123164366 | -12.767 |
| 10.878457327550484 | -6.824 |
| 12.093973715071392 | 4.33 |
| 4.0986271474597284 | 12.179 |
| -7.000880908890454 | 10.78 |
| -12.799136115010738 | 1.232 |
| -8.951178363639245 | -9.237 |
| 1.6126209143848296 | -12.765 |
| 10.962435402092778 | -6.744 |
| 12.136509205953345 | 4.298 |
| 4.299154197560116 | 12.14 |
| -6.712340736011539 | 10.997 |
| -12.768262790757783 | 1.749 |
| -9.443698886873147 | -8.776 |
| 0.787271766632427 | -12.872 |
| 10.43631921301221 | -7.582 |
| 12.498758547842655 | 3.209 |
| 5.516477775439994 | 11.67 |
| -5.436624917785598 | 11.712 |
| -12.476541916524717 | 3.343 |
| -10.58412705305759 | -7.411 |
| -1.148958811582311 | -12.874 |
| 9.0943073275309 | -9.19 |
| 12.89521559736619 | 0.992 |
| 7.604471721561414 | 10.467 |
| -3.0211720598191873 | 12.584 |
| -11.52454658840124 | 5.897 |
| -11.99002408267225 | -4.893 |
| -4.131852076071486 | -12.278 |
| 6.576851265263348 | -11.165 |
| 12.74544173476304 | -2.362 |
| 10.161891845463973 | 8.054 |
| 0.6336222473043424 | 12.955 |
| -9.31768869610197 | 9.029 |
| -12.939156229371905 | -1.018 |
| -7.813565070565803 | -10.369 |
| 2.5670746836388965 | -12.731 |
| 11.21694718232323 | -6.555 |
| 12.36676228145925 | 3.994 |
| 5.28757638292993 | 11.876 |
| -5.289271073031972 | 11.88 |
| -12.364625467777186 | 4.041 |
| -11.303067594103771 | -6.447 |
| -2.839497883436875 | -12.703 |
| 7.468443160987922 | -10.666 |
| 12.913569316098656 | -1.7 |
| 9.99552264007874 | 8.358 |
| 0.6366753582798874 | 13.018 |
| -9.121860783852465 | 9.315 |
| -13.037197613886939 | -0.341 |
| -8.64443073136251 | -9.771 |
| 1.2281134635252025 | -12.992 |
| 10.314815208478338 | -8.001 |
| 12.901109251109412 | 2.02 |
| 7.398681490821656 | 10.765 |
| -2.7167127350694042 | 12.781 |
| -11.132780788328684 | 6.849 |
| -12.647025874028362 | -3.318 |
| -6.360861518784827 | -11.428 |
| 3.825196445643416 | -12.512 |
| 11.661047873679761 | -5.942 |
| 12.385834164286118 | 4.241 |
| 5.5966073758115575 | 11.84 |
| -4.566293795836634 | 12.278 |
| -11.971251924060146 | 5.33 |
| -12.196223629730014 | -4.804 |
| -5.144520465174831 | -12.061 |
| 4.956011629872993 | -12.144 |
| 12.113287380452764 | -5.042 |
| 12.125918874100643 | 5.023 |
| 5.024314587992097 | 12.13 |
| -5.004724252137709 | 12.142 |
| -12.110977143953626 | 5.091 |
| -12.193314779659804 | -4.902 |
| -5.241888825720261 | -12.056 |
| 4.712538512265312 | -12.277 |
| 11.960243306927145 | -5.476 |
| 12.388183260930298 | 4.436 |
| 5.790699346626337 | 11.82 |
| -4.068723734464714 | 12.522 |
| -11.629155575349031 | 6.183 |
| -12.67094176047655 | -3.609 |
| -6.649253664774257 | -11.379 |
| 3.0552098355925645 | -12.824 |
| 11.059968100506326 | -7.182 |
| 12.970770993731321 | 2.404 |
| 7.774936953451291 | 10.662 |
| -1.6543986569661715 | 13.096 |
| -10.173985259708491 | 8.417 |
| -13.183697130764013 | -0.806 |
| -9.09488485048495 | -9.584 |
| -0.13840210644123516 | -13.216 |
| 8.880705938443532 | -9.794 |
| 13.17264308770788 | -1.176 |
| 10.495403580372967 | 8.053 |
| 2.297944243872107 | 13.032 |
| -7.093007176158971 | 11.177 |
| -12.772347809077472 | 3.494 |
| -11.812601456244701 | -5.993 |
| -4.748375356302124 | -12.37 |
| 4.749868506436846 | -12.374 |
| 11.80273808900318 | -6.04 |
| 12.82838857795656 | 3.365 |
| 7.3416612421859675 | 11.05 |
| -1.846943000869883 | 13.142 |
| -10.094389175976932 | 8.621 |
| -13.27752844925037 | -0.209 |
| -9.840354405326645 | -8.923 |
| -1.5272274138082396 | -13.199 |
| 7.528482877026226 | -10.954 |
| 12.872329661802901 | -3.329 |
| 11.912966423140926 | 5.914 |
| 5.155571972898735 | 12.265 |
| -4.090404296243747 | 12.664 |
| -11.350772173884534 | 6.956 |
| -13.152716406480462 | -2.083 |
| -8.668854906339417 | -10.114 |
| -0.06976924508377094 | -13.325 |
| 8.549989026696796 | -10.226 |
| 13.130770035460435 | -2.315 |
| 11.550613836533714 | 6.669 |
| 4.584993117417582 | 12.529 |
| -4.498817110783848 | 12.565 |
| -11.490906046666584 | 6.796 |
| -13.189754719289876 | -2.089 |
| -8.851499497826795 | -10.005 |
| -0.4896515848460674 | -13.354 |
| 8.081474813576628 | -10.647 |
| 12.995928538815326 | -3.144 |
| 12.072078189951256 | 5.758 |
| 5.759879740751259 | 12.076 |
| -3.101559415123405 | 13.019 |
| -10.57820021136174 | 8.205 |
| -13.39001457041495 | -0.21 |
| -10.336554332436975 | -8.521 |
| -2.786016683848288 | -13.107 |
| 5.959964023001455 | -12.006 |
| 12.122240174926796 | -5.73 |
| 13.073984523244967 | 2.994 |
| 8.443381934700142 | 10.427 |
| 0.23422586567319875 | 13.419 |
| -8.060641502889265 | 10.736 |
| -12.953202324738118 | 3.544 |
| -12.419735062084369 | -5.119 |
| -6.718750024017707 | -11.637 |
| 1.7544895395808229 | -13.327 |
| 9.491031474391544 | -9.524 |
| 13.325558450569183 | -1.825 |
| 11.72145583078546 | 6.605 |
| 5.366497911490766 | 12.342 |
| -3.142758183797284 | 13.091 |
| -10.376244984924996 | 8.584 |
| -13.454751007072137 | 0.658 |
| -11.184415557249583 | -7.516 |
| -4.49943831647538 | -12.706 |
| 3.942145125212506 | -12.894 |
| 10.828000679919683 | -8.042 |
| 13.491481726091601 | -0.071 |
| 10.93218698898134 | 7.914 |
| 4.1717294508025935 | 12.839 |
| -4.173016968105048 | 12.843 |
| -10.914596665063838 | 7.959 |
| -13.51231477384616 | 0.071 |
| -11.01781072194063 | -7.83 |
| -4.401952781763462 | -12.784 |
| 3.8413075100152727 | -12.968 |
| 10.646575050485824 | -8.348 |
| 13.517176390638257 | -0.661 |
| 11.43008930667455 | 7.254 |
| 5.182171506163886 | 12.511 |
| -2.931854909410215 | 13.225 |
| -9.974115511227021 | 9.172 |
| -13.428761350528518 | 1.84 |
| -12.091288185122176 | -6.134 |
| -6.4714657110623905 | -11.919 |
| 1.4181027899530647 | -13.492 |
| 8.795527135591938 | -10.335 |
| 13.093866948022763 | -3.582 |
| 12.84705077768188 | 4.399 |
| 8.174654087353465 | 10.848 |
| 0.7111148340858341 | 13.569 |
| -6.979881492952551 | 11.663 |
| -12.291755652491991 | 5.81 |
| -13.454103732499572 | -1.987 |
| -10.10986608251094 | -9.103 |
| -3.407254583074939 | -13.175 |
| 4.409325827960627 | -12.879 |
| 10.759277400832989 | -8.346 |
| 13.576958971324045 | -1.092 |
| 11.973883173816601 | 6.501 |
| 6.503276295474145 | 11.978 |
| -1.04593605458701 | 13.593 |
| -8.245220405842645 | 10.863 |
| -12.810810745688357 | 4.688 |
| -13.32237260344498 | -2.953 |
| -9.652007583736417 | -9.652 |
| -2.978564203620866 | -13.325 |
| 4.6041593771957405 | -12.859 |
| 10.751499719557186 | -8.43 |
| 13.591799233649313 | -1.429 |
| 12.287263620751864 | 5.993 |
| 7.266875599680642 | 11.584 |
| 0.07162365114992443 | 13.679 |
| -7.129148437362303 | 11.679 |
| -12.19565178652469 | 6.214 |
| -13.649459829996925 | -1.074 |
| -11.094195317831083 | -8.031 |
| -5.308963561469634 | -12.63 |
| 2.0019461414772053 | -13.557 |
| 8.719572246934415 | -10.578 |
| 12.925971436766416 | -4.577 |
| 13.446052951057384 | 2.711 |
| 10.164456418054842 | 9.217 |
| 4.035703492067714 | 13.118 |
| -3.2050102791757724 | 13.35 |
| -9.539974933001938 | 9.879 |
| -13.23144575342035 | 3.694 |
| -13.29187104358534 | -3.487 |
| -9.736721373667084 | -9.703 |
| -3.558761898859867 | -13.281 |
| 3.559840254119466 | -13.286 |
| 9.711616338840972 | -9.746 |
| 13.274721463664381 | -3.632 |
| 13.334161525618963 | 3.424 |
| 9.905908521232623 | 9.566 |
| 3.912311401917367 | 13.208 |
| -3.076200527732774 | 13.431 |
| -9.258548767320383 | 10.211 |
| -13.067356943451356 | 4.398 |
| -13.560723938952208 | -2.513 |
| -10.645204167410807 | -8.775 |
| -5.0801188549870915 | -12.831 |
| 1.730120815183074 | -13.695 |
| 8.096824934888922 | -11.185 |
| 12.466959227118226 | -5.946 |
| 13.79773140676966 | 0.723 |
| 11.796783326404418 | 7.201 |
| 6.9750944253025216 | 11.936 |
| 0.5067519851849073 | 13.82 |
| -6.064134170068452 | 12.433 |
| -11.194772641865926 | 8.133 |
| -13.703577457956813 | 1.95 |
| -13.035444261931962 | -4.667 |
| -9.374732202466571 | -10.195 |
| -3.58572221669594 | -13.382 |
| 2.9994922867814995 | -13.53 |
| 8.892095494282804 | -10.635 |
| 12.783169023554239 | -5.374 |
| 13.829952553022647 | 1.064 |
| 11.830382296367713 | 7.25 |
| 7.251844688847688 | 11.834 |
| 1.113428429917621 | 13.839 |
| -5.247263898594071 | 12.858 |
| -10.46825143791546 | 9.132 |
| -13.453218245073689 | 3.479 |
| -13.59625165658358 | -2.89 |
| -10.896604465314871 | -8.637 |
| -5.943835644407703 | -12.574 |
| 0.2185280213396635 | -13.911 |
| 6.318034427268009 | -12.4 |
| 11.117671810902738 | -8.378 |
| 13.66450034015197 | -2.681 |
| 13.473233747550287 | 3.535 |
| 10.610767105052181 | 9.03 |
| 5.668891991142379 | 12.733 |
| -0.36495025670290265 | 13.937 |
| -6.3095790226327875 | 12.437 |
| -11.022662403628846 | 8.55 |
| -13.618105142112729 | 3.044 |
| -13.627465106109641 | -3.021 |
| -11.077196032760611 | -8.5 |
| -6.470701318110045 | -12.377 |
| -0.6824720233129412 | -13.954 |
| 5.212504232552863 | -12.967 |
| 10.140129206621953 | -9.623 |
| 13.221501405289843 | -4.553 |
| 13.925422982829089 | 1.316 |
| 12.15360262169556 | 6.932 |
| 8.246294043447294 | 11.308 |
| 2.910763702120094 | 13.694 |
| -2.911629939458916 | 13.698 |
| -8.214099405166229 | 11.347 |
| -12.098330137014578 | 7.07 |
| -13.923774927549399 | 1.611 |
| -13.408189608442418 | -4.099 |
| -10.66469368801715 | -9.109 |
| -6.171979965431765 | -12.599 |
| -0.6855251343611082 | -14.017 |
| 4.893080084667638 | -13.157 |
| 9.665645477406319 | -10.185 |
| 12.880872948847538 | -5.601 |
| 14.049229629253919 | -0.147 |
| 13.012339522676278 | 5.31 |
| 9.958077574424946 | 9.923 |
| 5.381485796998072 | 12.992 |
| 3.180167189352903e-08 | 14.067 |
| -5.361977724462846 | 13.009 |
| -9.900280419414447 | 10.005 |
| -12.950320151863108 | 5.524 |
| -14.0811883728953 | 0.246 |
| -13.151814269732403 | -5.049 |
| -10.322750370519948 | -9.592 |
| -6.023965244930418 | -12.744 |
| -0.8853463573372448 | -14.072 |
| 4.35842716100744 | -13.414 |
| 8.974003532987675 | -10.886 |
| 12.331110481967722 | -6.863 |
| 13.986057010291134 | -1.916 |
| 13.736406054341233 | 3.272 |
| 11.640782432526384 | 8 |
| 8.00284814911633 | 11.644 |
| 3.323341896534488 | 13.737 |
| -1.7718985574793007 | 14.026 |
| -6.6173074280870186 | 12.498 |
| -10.594602778889973 | 9.373 |
| -13.210163023331388 | 5.071 |
| -14.153390584388701 | 0.148 |
| -13.329653807895442 | -4.773 |
| -10.864976483398234 | -9.085 |
| -7.08333336146425 | -12.269 |
| -2.4607394163927023 | -13.956 |
| 2.4370949644013034 | -13.964 |
| 7.025191007833532 | -12.316 |
| 10.768998021143341 | -9.23 |
| 13.245172289231213 | -5.084 |
| 14.18680353609006 | -0.371 |
| 13.50867556845468 | 4.363 |
| 11.310724855740917 | 8.585 |
| 7.86046582466042 | 11.831 |
| 3.55748258934465 | 13.756 |
| -1.115099865336201 | 14.169 |
| -5.646119148374071 | 13.047 |
| -9.5524265229799 | 10.535 |
| -12.42940985667726 | 6.918 |
| -13.99089794954537 | 2.593 |
| -14.094815516342814 | -1.981 |
| -12.752696201076661 | -6.33 |
| -10.122969196955303 | -10.018 |
| -6.489616853725894 | -12.682 |
| -2.229191159465962 | -14.075 |
| 2.2298429043939607 | -14.079 |
| 6.450964867392643 | -12.716 |
| 10.032166925261063 | -10.138 |
| 12.643171048321992 | -6.61 |
| 14.054027302846178 | -2.478 |
| 14.152875400452446 | 1.863 |
| 12.95183266808051 | 6.012 |
| 10.581159006002352 | 9.594 |
| 7.272929256220178 | 12.298 |
| 3.336323357548724 | 13.897 |
| -0.8727397131086722 | 14.269 |
| -4.984580245372202 | 13.403 |
| -8.648286478863623 | 11.394 |
| -11.560988569053883 | 8.43 |
| -13.491556330073962 | 4.778 |
| -14.297046170815502 | 0.749 |
| -13.93096123030056 | -3.319 |
| -12.443146460977589 | -7.097 |
| -9.971850471979531 | -10.29 |
| -6.729092429661044 | -12.656 |
| -2.9809339000503954 | -14.024 |
| 0.9754525933181224 | -14.308 |
| 4.835912363032456 | -13.506 |
| 8.312684795590092 | -11.697 |
| 11.155282633797043 | -9.033 |
| 13.16745422122313 | -5.725 |
| 14.219214779183716 | -2.024 |
| 14.253381213130243 | 1.801 |
| 13.286496970966326 | 5.476 |
| 11.404454287352388 | 8.751 |
| 8.753482074913284 | 11.408 |
| 5.527447755672694 | 13.279 |
| 1.952607832123281 | 14.254 |
| -1.728969305076752 | 14.287 |
| -5.27609054467699 | 13.394 |
| -8.46410760539593 | 11.65 |
| -11.09860114604655 | 9.182 |
| -13.026322721753067 | 6.158 |
| -14.142880513197783 | 2.775 |
| -14.39690912783748 | -0.755 |
| -13.790711511636243 | -4.216 |
| -12.377586282682445 | -7.408 |
| -10.256244099244832 | -10.149 |
| -7.562863272095096 | -12.293 |
| -4.461432888991421 | -13.731 |
| -1.1330801417965233 | -14.397 |
| 2.2349204213900555 | -14.272 |
| 5.4597993375909 | -13.379 |
| 8.37302658377654 | -11.782 |
| 10.828651440191722 | -9.58 |
| 12.709892475387912 | -6.901 |
| 13.93375179036622 | -3.89 |
| 14.453557144086966 | -0.707 |
| 14.259457502050122 | 2.489 |
| 13.377005744427164 | 5.541 |
| 11.864052128036574 | 8.307 |
| 9.806240636358744 | 10.664 |
| 7.31144617847135 | 12.512 |
| 4.503513777624088 | 13.779 |
| 1.515662752008403 | 14.421 |
| -1.5160982179568432 | 14.425 |
| -4.459232230033282 | 13.806 |
| -7.190343895298661 | 12.606 |
| -9.600043885386656 | 10.889 |
| -11.596853114426336 | 8.739 |
| -13.110051240109158 | 6.253 |
| -14.09143214687434 | 3.54 |
| -14.515982527648223 | 0.71 |
| -14.381546545578923 | -2.124 |
| -13.707578361365389 | -4.854 |
| -12.533114180775296 | -7.383 |
| -10.914116086394614 | -9.622 |
| -8.920351437890501 | -11.5 |
| -6.6319746391999255 | -12.96 |
| -4.135973491093763 | -13.963 |
| -1.5226313167495873 | -14.487 |
| 1.1178601370809613 | -14.528 |
| 3.6985220081020933 | -14.098 |
| 6.138351263593053 | -13.224 |
| 8.36465633441522 | -11.946 |
| 10.314920145480892 | -10.315 |
| 11.938167939682112 | -8.39 |
| 13.19583819923337 | -6.238 |
| 14.062173465684626 | -3.926 |
| 14.524163509885861 | -1.527 |
| 14.581085849120736 | 0.892 |
| 14.243697958083423 | 3.262 |
| 13.53314172812459 | 5.523 |
| 12.479623967107624 | 7.618 |
| 11.120937270130037 | 9.498 |
| 9.500883767568508 | 11.124 |
| 7.667660454543695 | 12.464 |
| 5.672259429731532 | 13.494 |
| 3.5669298323529626 | 14.201 |
| 1.4037409528362363 | 14.578 |
| -0.7667217230685113 | 14.63 |
| -2.896503573529821 | 14.365 |
| -4.941254629164592 | 13.8 |
| -6.861020869741697 | 12.958 |
| -8.620850337787239 | 11.866 |
| -10.191217150654012 | 10.553 |
| -11.548271425009759 | 9.055 |
| -12.673927168374833 | 7.406 |
| -13.55580334069793 | 5.643 |
| -14.187035564249966 | 3.801 |
| -14.565977416951448 | 1.918 |
| -14.69581095024171 | 0.026 |
| -14.584086113874916 | -1.842 |
| -14.242208240798071 | -3.657 |
| -13.684891742396049 | -5.391 |
| -12.929596787411421 | -7.02 |
| -11.995964081565871 | -8.525 |
| -10.905261018997082 | -9.888 |
| -9.679850521802333 | -11.096 |
| -8.342691894806071 | -12.139 |
| -6.916881057306632 | -13.009 |
| -5.425235629214397 | -13.703 |
| -3.889928580219577 | -14.219 |
| -2.332172536238982 | -14.56 |
| -0.7719553912243037 | -14.73 |
| 0.7721733844176044 | -14.734 |
| 2.2832674148269856 | -14.581 |
| 3.746101621371838 | -14.279 |
| 5.147247197633475 | -13.841 |
| 6.475107114279549 | -13.276 |
| 7.719916262242904 | -12.598 |
| 8.873710550629786 | -11.819 |
| 9.930269351471596 | -10.952 |
| 10.885035650774162 | -10.009 |
| 11.735018135958484 | -9.005 |
| 12.47867924711884 | -7.95 |
| 13.115812955466183 | -6.857 |
| 13.647415725602633 | -5.737 |
| 14.075553780993078 | -4.601 |
| 14.403229437219977 | -3.458 |
| 14.634248907333221 | -2.318 |
| 14.773093624803364 | -1.189 |
| 14.824796782373284 | -0.078 |
| 14.794826454099738 | 1.009 |
| 14.68897635819169 | 2.064 |
| 14.513265033653257 | 3.085 |
| 14.273843946127045 | 4.066 |
| 13.976914809131388 | 5.004 |
| 13.628656206267028 | 5.898 |
| 13.235159428392228 | 6.744 |
| 12.802373294584891 | 7.541 |
| 12.336057608152968 | 8.289 |
| 11.841744804001035 | 8.988 |
| 11.324709272691763 | 9.638 |
| 10.789943794699424 | 10.239 |
| 10.242142484820963 | 10.793 |
| 9.685689628913233 | 11.3 |
| 9.124653791039542 | 11.763 |
| 8.562786575893034 | 12.184 |
| 8.00352544787167 | 12.563 |
| 7.450000032732305 | 12.904 |
| 6.90504135696985 | 13.208 |
| 6.371193514219958 | 13.478 |
| 5.850727286216572 | 13.717 |
| 5.345655282783624 | 13.926 |
| 4.857748207200836 | 14.108 |
| 4.388551890428781 | 14.265 |
| 3.9394047784492416 | 14.4 |
| 3.511455592667473 | 14.515 |
| 3.1056809188362657 | 14.611 |
| 2.7229025142192285 | 14.691 |
| 2.363804151168975 | 14.758 |
| 2.028947845735664 | 14.812 |
| 1.718789342647937 | 14.855 |
| 1.433692752849008 | 14.889 |
| 1.1739442579999946 | 14.916 |
| 0.939764813844413 | 14.937 |
| 0.7313218002844303 | 14.953 |
| 0.5487395762147586 | 14.965 |
| 0.3921089099291875 | 14.974 |
| 0.2614952615419171 | 14.981 |
| 0.15694590289987045 | 14.987 |
| 0.0784958629446714 | 14.991 |
| 0.026172691827031573 | 14.996 |
| 3.8562654163659876e-08 | 15 |
| 3.860065843221437e-08 | 15.004 |